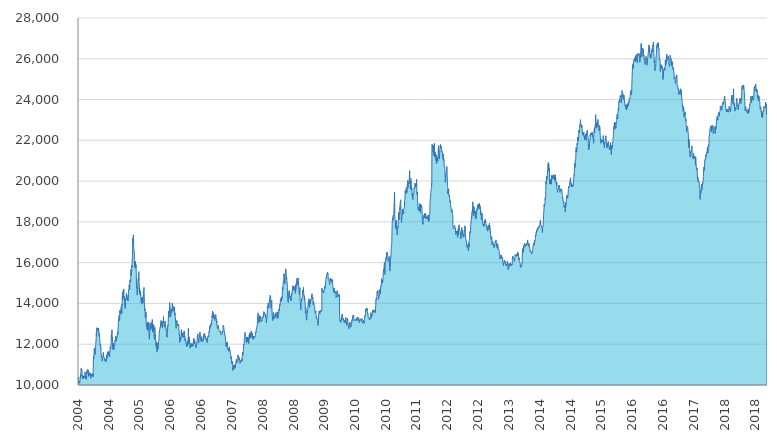
| Category | ICB |
|---|---|
| 2004-01-02 | 10000 |
| 2004-01-05 | 10226.385 |
| 2004-01-06 | 10384.872 |
| 2004-01-07 | 10288.02 |
| 2004-01-08 | 10213.6 |
| 2004-01-09 | 10173.267 |
| 2004-01-12 | 10197.253 |
| 2004-01-13 | 10195.708 |
| 2004-01-14 | 10145.057 |
| 2004-01-15 | 10087.779 |
| 2004-01-16 | 10147.823 |
| 2004-01-19 | 10229.214 |
| 2004-01-20 | 10405.341 |
| 2004-01-21 | 10366.841 |
| 2004-01-22 | 10520.916 |
| 2004-01-23 | 10407.08 |
| 2004-01-26 | 10699.998 |
| 2004-01-27 | 10803.626 |
| 2004-01-28 | 10741.446 |
| 2004-01-29 | 10805.027 |
| 2004-01-30 | 10780.426 |
| 2004-02-02 | 10747.586 |
| 2004-02-03 | 10600.139 |
| 2004-02-04 | 10427.461 |
| 2004-02-05 | 10487.058 |
| 2004-02-06 | 10367.771 |
| 2004-02-09 | 10293.299 |
| 2004-02-10 | 10457.689 |
| 2004-02-11 | 10330.727 |
| 2004-02-12 | 10387.953 |
| 2004-02-13 | 10345.823 |
| 2004-02-16 | 10329.406 |
| 2004-02-17 | 10445.147 |
| 2004-02-18 | 10334.424 |
| 2004-02-19 | 10368.844 |
| 2004-02-20 | 10377.153 |
| 2004-02-25 | 10464.3 |
| 2004-02-26 | 10641.545 |
| 2004-02-27 | 10587.933 |
| 2004-03-01 | 10479.385 |
| 2004-03-02 | 10363.636 |
| 2004-03-03 | 10308.924 |
| 2004-03-04 | 10395.507 |
| 2004-03-05 | 10359.939 |
| 2004-03-08 | 10412.348 |
| 2004-03-09 | 10278.133 |
| 2004-03-10 | 10387.27 |
| 2004-03-11 | 10657.972 |
| 2004-03-12 | 10561.22 |
| 2004-03-15 | 10690.399 |
| 2004-03-16 | 10758.439 |
| 2004-03-17 | 10657.382 |
| 2004-03-18 | 10627.488 |
| 2004-03-19 | 10626.24 |
| 2004-03-22 | 10732.745 |
| 2004-03-23 | 10733.175 |
| 2004-03-24 | 10743.198 |
| 2004-03-25 | 10420.792 |
| 2004-03-26 | 10493.157 |
| 2004-03-29 | 10553.775 |
| 2004-03-30 | 10603.082 |
| 2004-03-31 | 10605.783 |
| 2004-04-01 | 10612.008 |
| 2004-04-02 | 10605.604 |
| 2004-04-05 | 10444.404 |
| 2004-04-06 | 10490.833 |
| 2004-04-07 | 10570.321 |
| 2004-04-08 | 10585.074 |
| 2004-04-12 | 10524.391 |
| 2004-04-13 | 10329.102 |
| 2004-04-14 | 10414.022 |
| 2004-04-15 | 10446.349 |
| 2004-04-16 | 10435.625 |
| 2004-04-19 | 10466.336 |
| 2004-04-20 | 10549.683 |
| 2004-04-22 | 10447.529 |
| 2004-04-23 | 10436.699 |
| 2004-04-26 | 10435.311 |
| 2004-04-27 | 10558.286 |
| 2004-04-28 | 10540.295 |
| 2004-04-29 | 10538.65 |
| 2004-04-30 | 10407.59 |
| 2004-05-03 | 11262.389 |
| 2004-05-04 | 11408.749 |
| 2004-05-05 | 11328.924 |
| 2004-05-06 | 11297.731 |
| 2004-05-07 | 11432.457 |
| 2004-05-10 | 11781.258 |
| 2004-05-11 | 11674.1 |
| 2004-05-12 | 11776.315 |
| 2004-05-13 | 11817.174 |
| 2004-05-14 | 11594.768 |
| 2004-05-17 | 11488.635 |
| 2004-05-18 | 11683.239 |
| 2004-05-19 | 11815.736 |
| 2004-05-20 | 11844.096 |
| 2004-05-21 | 11982.556 |
| 2004-05-24 | 12198.78 |
| 2004-05-25 | 12274.062 |
| 2004-05-26 | 12558.47 |
| 2004-05-27 | 12423.163 |
| 2004-05-28 | 12573.597 |
| 2004-05-31 | 12814.849 |
| 2004-06-01 | 12720.113 |
| 2004-06-02 | 12791.431 |
| 2004-06-03 | 12762.095 |
| 2004-06-04 | 12766.636 |
| 2004-06-07 | 12620.423 |
| 2004-06-08 | 12662.955 |
| 2004-06-09 | 12781.211 |
| 2004-06-11 | 12794.869 |
| 2004-06-14 | 12725.119 |
| 2004-06-15 | 12509.287 |
| 2004-06-16 | 12546.936 |
| 2004-06-17 | 12393.009 |
| 2004-06-18 | 12505.642 |
| 2004-06-21 | 12295.024 |
| 2004-06-22 | 12210.085 |
| 2004-06-23 | 12134.181 |
| 2004-06-24 | 12120.795 |
| 2004-06-25 | 11937.802 |
| 2004-06-28 | 11991.012 |
| 2004-06-29 | 11896.103 |
| 2004-06-30 | 11919.736 |
| 2004-07-01 | 11855.571 |
| 2004-07-02 | 11543.948 |
| 2004-07-05 | 11373.027 |
| 2004-07-06 | 11394.053 |
| 2004-07-07 | 11432.2 |
| 2004-07-08 | 11398.256 |
| 2004-07-12 | 11165.635 |
| 2004-07-13 | 11193.224 |
| 2004-07-14 | 11305.329 |
| 2004-07-15 | 11399.563 |
| 2004-07-16 | 11402.646 |
| 2004-07-19 | 11403.991 |
| 2004-07-20 | 11600.611 |
| 2004-07-21 | 11469.199 |
| 2004-07-22 | 11504.326 |
| 2004-07-23 | 11384.558 |
| 2004-07-26 | 11342.696 |
| 2004-07-27 | 11346.592 |
| 2004-07-28 | 11326.723 |
| 2004-07-29 | 11250.566 |
| 2004-07-30 | 11193.229 |
| 2004-08-02 | 11219.57 |
| 2004-08-03 | 11284.004 |
| 2004-08-04 | 11215.927 |
| 2004-08-05 | 11243.058 |
| 2004-08-06 | 11225.994 |
| 2004-08-09 | 11240.029 |
| 2004-08-10 | 11126.411 |
| 2004-08-11 | 11138.165 |
| 2004-08-12 | 11160.884 |
| 2004-08-13 | 11181.128 |
| 2004-08-16 | 11468.445 |
| 2004-08-17 | 11492.81 |
| 2004-08-18 | 11296.246 |
| 2004-08-19 | 11391.215 |
| 2004-08-20 | 11377.096 |
| 2004-08-23 | 11615.153 |
| 2004-08-24 | 11564.252 |
| 2004-08-25 | 11580.828 |
| 2004-08-26 | 11634.735 |
| 2004-08-27 | 11608.129 |
| 2004-08-30 | 11451.291 |
| 2004-08-31 | 11497.755 |
| 2004-09-01 | 11631.317 |
| 2004-09-02 | 11660.988 |
| 2004-09-03 | 11557.301 |
| 2004-09-06 | 11534.009 |
| 2004-09-08 | 11390.073 |
| 2004-09-09 | 11609.024 |
| 2004-09-10 | 11605.981 |
| 2004-09-13 | 11822.301 |
| 2004-09-14 | 11872.606 |
| 2004-09-15 | 11770.545 |
| 2004-09-16 | 11854.586 |
| 2004-09-17 | 11841.725 |
| 2004-09-20 | 12070.183 |
| 2004-09-21 | 12320.676 |
| 2004-09-22 | 12473.635 |
| 2004-09-23 | 12290.553 |
| 2004-09-24 | 12402.135 |
| 2004-09-27 | 12712.989 |
| 2004-09-28 | 12283.498 |
| 2004-09-29 | 12356.659 |
| 2004-09-30 | 12306.296 |
| 2004-10-01 | 12079.943 |
| 2004-10-04 | 11745.38 |
| 2004-10-05 | 11912.738 |
| 2004-10-06 | 11972.846 |
| 2004-10-07 | 12063.096 |
| 2004-10-08 | 11877.111 |
| 2004-10-11 | 11804.592 |
| 2004-10-13 | 11729.811 |
| 2004-10-14 | 11836.705 |
| 2004-10-15 | 11964.842 |
| 2004-10-18 | 11942.356 |
| 2004-10-19 | 12011.307 |
| 2004-10-20 | 12165.555 |
| 2004-10-21 | 12158.872 |
| 2004-10-22 | 12109.704 |
| 2004-10-25 | 12255.085 |
| 2004-10-26 | 12225.091 |
| 2004-10-27 | 12405.04 |
| 2004-10-28 | 12383.85 |
| 2004-10-29 | 12199.725 |
| 2004-11-01 | 12157.878 |
| 2004-11-03 | 12277.801 |
| 2004-11-04 | 12331.126 |
| 2004-11-05 | 12313.033 |
| 2004-11-08 | 12511.712 |
| 2004-11-09 | 12521.516 |
| 2004-11-10 | 12565.146 |
| 2004-11-11 | 12634.174 |
| 2004-11-12 | 12469.086 |
| 2004-11-16 | 13020.265 |
| 2004-11-17 | 13195.34 |
| 2004-11-18 | 13248.834 |
| 2004-11-19 | 13249.469 |
| 2004-11-22 | 13407.914 |
| 2004-11-23 | 13335.348 |
| 2004-11-24 | 13320.814 |
| 2004-11-25 | 13259.628 |
| 2004-11-26 | 13154.354 |
| 2004-11-29 | 13674.389 |
| 2004-11-30 | 13464.281 |
| 2004-12-01 | 13606.684 |
| 2004-12-02 | 13579.579 |
| 2004-12-03 | 13555.175 |
| 2004-12-06 | 13615.081 |
| 2004-12-07 | 13687.496 |
| 2004-12-08 | 13804.293 |
| 2004-12-09 | 13846.816 |
| 2004-12-10 | 13652.328 |
| 2004-12-13 | 13546.865 |
| 2004-12-14 | 13493.345 |
| 2004-12-15 | 13964.554 |
| 2004-12-16 | 13886.022 |
| 2004-12-17 | 14292.979 |
| 2004-12-20 | 14561.121 |
| 2004-12-21 | 14411.527 |
| 2004-12-22 | 14182.883 |
| 2004-12-23 | 14594.586 |
| 2004-12-27 | 14514.052 |
| 2004-12-28 | 14503.145 |
| 2004-12-29 | 14709.838 |
| 2004-12-30 | 14289.635 |
| 2005-01-03 | 14323.83 |
| 2005-01-04 | 14354.716 |
| 2005-01-05 | 13924.641 |
| 2005-01-06 | 13947.709 |
| 2005-01-07 | 13817.528 |
| 2005-01-10 | 13742.224 |
| 2005-01-11 | 13786.109 |
| 2005-01-12 | 14057.763 |
| 2005-01-13 | 14252.914 |
| 2005-01-14 | 14190.411 |
| 2005-01-17 | 14178.061 |
| 2005-01-18 | 14492.513 |
| 2005-01-19 | 14465.934 |
| 2005-01-20 | 14365.233 |
| 2005-01-21 | 14332.407 |
| 2005-01-24 | 14391.888 |
| 2005-01-26 | 14321.097 |
| 2005-01-27 | 14156.947 |
| 2005-01-28 | 14263.281 |
| 2005-01-31 | 14173.268 |
| 2005-02-01 | 14174.393 |
| 2005-02-02 | 14137.093 |
| 2005-02-03 | 14138.028 |
| 2005-02-04 | 14678.646 |
| 2005-02-09 | 14732.793 |
| 2005-02-10 | 14918.179 |
| 2005-02-11 | 14797.797 |
| 2005-02-14 | 14667.816 |
| 2005-02-15 | 15107.303 |
| 2005-02-16 | 15113.932 |
| 2005-02-17 | 15081.359 |
| 2005-02-18 | 15165.007 |
| 2005-02-21 | 15039.212 |
| 2005-02-22 | 15118.6 |
| 2005-02-23 | 15588.029 |
| 2005-02-24 | 15673.488 |
| 2005-02-25 | 15355.76 |
| 2005-02-28 | 15536.061 |
| 2005-03-01 | 15579.685 |
| 2005-03-02 | 15643.538 |
| 2005-03-03 | 15865.664 |
| 2005-03-04 | 15764.601 |
| 2005-03-07 | 16281.247 |
| 2005-03-08 | 16633.868 |
| 2005-03-09 | 16630.158 |
| 2005-03-10 | 17204.255 |
| 2005-03-11 | 16975.528 |
| 2005-03-14 | 17102.876 |
| 2005-03-15 | 17367.914 |
| 2005-03-16 | 17189.634 |
| 2005-03-17 | 16966.272 |
| 2005-03-18 | 16680.309 |
| 2005-03-21 | 16567.043 |
| 2005-03-22 | 16521.382 |
| 2005-03-23 | 16112.526 |
| 2005-03-24 | 15838.388 |
| 2005-03-28 | 15953.038 |
| 2005-03-29 | 15740.167 |
| 2005-03-30 | 15973.228 |
| 2005-03-31 | 16074.216 |
| 2005-04-01 | 15836.431 |
| 2005-04-04 | 15744.663 |
| 2005-04-05 | 15908.041 |
| 2005-04-06 | 15596.449 |
| 2005-04-07 | 15504.945 |
| 2005-04-08 | 15005.962 |
| 2005-04-11 | 14723.851 |
| 2005-04-12 | 14793.178 |
| 2005-04-13 | 14721.811 |
| 2005-04-14 | 14407.916 |
| 2005-04-15 | 14610.339 |
| 2005-04-18 | 14560.267 |
| 2005-04-19 | 14974.808 |
| 2005-04-20 | 15138.842 |
| 2005-04-22 | 15214.854 |
| 2005-04-25 | 15103.108 |
| 2005-04-26 | 15559.116 |
| 2005-04-27 | 15566.624 |
| 2005-04-28 | 15469.07 |
| 2005-04-29 | 15062.54 |
| 2005-05-02 | 14617.4 |
| 2005-05-03 | 14486.364 |
| 2005-05-04 | 14730.051 |
| 2005-05-05 | 14508.962 |
| 2005-05-06 | 14532.984 |
| 2005-05-09 | 14461.442 |
| 2005-05-10 | 14387.593 |
| 2005-05-11 | 14593.722 |
| 2005-05-12 | 14442.52 |
| 2005-05-13 | 14444.209 |
| 2005-05-16 | 14072.104 |
| 2005-05-17 | 14262.523 |
| 2005-05-18 | 14156.733 |
| 2005-05-19 | 13985.747 |
| 2005-05-20 | 13967.45 |
| 2005-05-23 | 13979.474 |
| 2005-05-24 | 14168.252 |
| 2005-05-25 | 14320.97 |
| 2005-05-27 | 14144.056 |
| 2005-05-30 | 14045.003 |
| 2005-05-31 | 14028.063 |
| 2005-06-01 | 14146.167 |
| 2005-06-02 | 14292.976 |
| 2005-06-03 | 14597.5 |
| 2005-06-06 | 14664.704 |
| 2005-06-07 | 14787.817 |
| 2005-06-08 | 14468.017 |
| 2005-06-09 | 14312.105 |
| 2005-06-10 | 13963.247 |
| 2005-06-13 | 13637.501 |
| 2005-06-14 | 13733.877 |
| 2005-06-15 | 13742.89 |
| 2005-06-16 | 13520.525 |
| 2005-06-17 | 13304.089 |
| 2005-06-20 | 13443.62 |
| 2005-06-21 | 13331.115 |
| 2005-06-22 | 13585.692 |
| 2005-06-23 | 13424.032 |
| 2005-06-24 | 13182.571 |
| 2005-06-27 | 12871.751 |
| 2005-06-28 | 12997.058 |
| 2005-06-29 | 12847.92 |
| 2005-06-30 | 12895.331 |
| 2005-07-01 | 12717.829 |
| 2005-07-04 | 12705.574 |
| 2005-07-05 | 12817.882 |
| 2005-07-06 | 13092.963 |
| 2005-07-07 | 13021.334 |
| 2005-07-08 | 12925.081 |
| 2005-07-11 | 12661.902 |
| 2005-07-12 | 12719.739 |
| 2005-07-13 | 12766.001 |
| 2005-07-14 | 13064.616 |
| 2005-07-15 | 12781.053 |
| 2005-07-18 | 12417.838 |
| 2005-07-19 | 12242.347 |
| 2005-07-20 | 12308.73 |
| 2005-07-21 | 12385.329 |
| 2005-07-22 | 12497.933 |
| 2005-07-25 | 13025.058 |
| 2005-07-26 | 12976.492 |
| 2005-07-27 | 12734.447 |
| 2005-07-28 | 12873.043 |
| 2005-07-29 | 12936.691 |
| 2005-08-01 | 12828.193 |
| 2005-08-02 | 13070.474 |
| 2005-08-03 | 12874.938 |
| 2005-08-04 | 12846.204 |
| 2005-08-05 | 12843.753 |
| 2005-08-08 | 12771.511 |
| 2005-08-09 | 12724.118 |
| 2005-08-10 | 12882.136 |
| 2005-08-11 | 13214.52 |
| 2005-08-12 | 13201.107 |
| 2005-08-15 | 12589.342 |
| 2005-08-16 | 12726.92 |
| 2005-08-17 | 12754.793 |
| 2005-08-18 | 12665.103 |
| 2005-08-19 | 12969.944 |
| 2005-08-22 | 12690.706 |
| 2005-08-23 | 12933.426 |
| 2005-08-24 | 12823.658 |
| 2005-08-25 | 12488.78 |
| 2005-08-26 | 12390 |
| 2005-08-29 | 12238.581 |
| 2005-08-30 | 12394.012 |
| 2005-08-31 | 12535.451 |
| 2005-09-01 | 12825.23 |
| 2005-09-02 | 12525.223 |
| 2005-09-05 | 12505.745 |
| 2005-09-06 | 12356.828 |
| 2005-09-08 | 12014.667 |
| 2005-09-09 | 11935.251 |
| 2005-09-12 | 11850.474 |
| 2005-09-13 | 11919.164 |
| 2005-09-14 | 12119.492 |
| 2005-09-15 | 11937.683 |
| 2005-09-16 | 11773.265 |
| 2005-09-19 | 11613.74 |
| 2005-09-20 | 12027.94 |
| 2005-09-21 | 11928.025 |
| 2005-09-22 | 12039.052 |
| 2005-09-23 | 11962.55 |
| 2005-09-26 | 11749.113 |
| 2005-09-27 | 11835.647 |
| 2005-09-28 | 12077.523 |
| 2005-09-29 | 12016.711 |
| 2005-09-30 | 12136.826 |
| 2005-10-03 | 12173.39 |
| 2005-10-04 | 12330.307 |
| 2005-10-05 | 12532.217 |
| 2005-10-06 | 12609.842 |
| 2005-10-07 | 12579.495 |
| 2005-10-10 | 12740.224 |
| 2005-10-11 | 12780.44 |
| 2005-10-13 | 12825.679 |
| 2005-10-14 | 12802.725 |
| 2005-10-17 | 13038.768 |
| 2005-10-18 | 13074.791 |
| 2005-10-19 | 13061.201 |
| 2005-10-20 | 13169.254 |
| 2005-10-21 | 12963.236 |
| 2005-10-24 | 12884.263 |
| 2005-10-25 | 13029.772 |
| 2005-10-26 | 13024.236 |
| 2005-10-27 | 13100.975 |
| 2005-10-28 | 13025.542 |
| 2005-10-31 | 12816.306 |
| 2005-11-01 | 12808.609 |
| 2005-11-03 | 13120.805 |
| 2005-11-04 | 13126.283 |
| 2005-11-07 | 13052.448 |
| 2005-11-08 | 13360.276 |
| 2005-11-09 | 13183.59 |
| 2005-11-10 | 13140.067 |
| 2005-11-11 | 13119.478 |
| 2005-11-14 | 12998.565 |
| 2005-11-16 | 12837.4 |
| 2005-11-17 | 12932.211 |
| 2005-11-18 | 12863.059 |
| 2005-11-21 | 13083.923 |
| 2005-11-22 | 13128.875 |
| 2005-11-23 | 12922.981 |
| 2005-11-24 | 12871.261 |
| 2005-11-25 | 12899.553 |
| 2005-11-28 | 12765.408 |
| 2005-11-29 | 12776.071 |
| 2005-11-30 | 12554.298 |
| 2005-12-01 | 12512.209 |
| 2005-12-02 | 12380.212 |
| 2005-12-05 | 12454.765 |
| 2005-12-06 | 12355.096 |
| 2005-12-07 | 12342.742 |
| 2005-12-08 | 12492.442 |
| 2005-12-09 | 12540.043 |
| 2005-12-12 | 12923.838 |
| 2005-12-13 | 12871.606 |
| 2005-12-14 | 12871.789 |
| 2005-12-15 | 13056.465 |
| 2005-12-16 | 13237.376 |
| 2005-12-19 | 13632.88 |
| 2005-12-20 | 13574.767 |
| 2005-12-21 | 13319.736 |
| 2005-12-22 | 13578.875 |
| 2005-12-23 | 13479.32 |
| 2005-12-26 | 13647.484 |
| 2005-12-27 | 14048.224 |
| 2005-12-28 | 13917.07 |
| 2005-12-29 | 13896.607 |
| 2006-01-02 | 13334.091 |
| 2006-01-03 | 13434.468 |
| 2006-01-04 | 13363.237 |
| 2006-01-05 | 13578.364 |
| 2006-01-06 | 13726.538 |
| 2006-01-09 | 13678.07 |
| 2006-01-10 | 13558.768 |
| 2006-01-11 | 13572.259 |
| 2006-01-12 | 13527.696 |
| 2006-01-13 | 13722.061 |
| 2006-01-16 | 13797.782 |
| 2006-01-17 | 14019.182 |
| 2006-01-18 | 13893.24 |
| 2006-01-19 | 13881.228 |
| 2006-01-20 | 13646.262 |
| 2006-01-23 | 13754.139 |
| 2006-01-24 | 13810.304 |
| 2006-01-26 | 13811.092 |
| 2006-01-27 | 13864.346 |
| 2006-01-30 | 13805.937 |
| 2006-01-31 | 13594.286 |
| 2006-02-01 | 13627.696 |
| 2006-02-02 | 13826.118 |
| 2006-02-03 | 13733.423 |
| 2006-02-06 | 13421.187 |
| 2006-02-07 | 13543.879 |
| 2006-02-08 | 13386.556 |
| 2006-02-09 | 13352.128 |
| 2006-02-10 | 13330.753 |
| 2006-02-13 | 12998.476 |
| 2006-02-14 | 12929.433 |
| 2006-02-15 | 12915.58 |
| 2006-02-16 | 12774.048 |
| 2006-02-17 | 12993.018 |
| 2006-02-20 | 13012.575 |
| 2006-02-21 | 13163.556 |
| 2006-02-22 | 13069.258 |
| 2006-02-23 | 13108.667 |
| 2006-02-24 | 13000.655 |
| 2006-03-01 | 12940.751 |
| 2006-03-02 | 12894.248 |
| 2006-03-03 | 12976.965 |
| 2006-03-06 | 12939.12 |
| 2006-03-07 | 12974.28 |
| 2006-03-08 | 12927.138 |
| 2006-03-09 | 12923.906 |
| 2006-03-10 | 12704.258 |
| 2006-03-13 | 12526.052 |
| 2006-03-14 | 12404.914 |
| 2006-03-15 | 12490.586 |
| 2006-03-16 | 12216.867 |
| 2006-03-17 | 12094.171 |
| 2006-03-20 | 12206.392 |
| 2006-03-21 | 12359.004 |
| 2006-03-22 | 12185.795 |
| 2006-03-23 | 12190.788 |
| 2006-03-24 | 12220.101 |
| 2006-03-27 | 12354.949 |
| 2006-03-28 | 12592.873 |
| 2006-03-29 | 12568.621 |
| 2006-03-30 | 12727.973 |
| 2006-03-31 | 12481.482 |
| 2006-04-03 | 12541.905 |
| 2006-04-04 | 12379.937 |
| 2006-04-05 | 12455.285 |
| 2006-04-06 | 12488.45 |
| 2006-04-07 | 12557.554 |
| 2006-04-10 | 12542.727 |
| 2006-04-11 | 12324.764 |
| 2006-04-12 | 12336.348 |
| 2006-04-13 | 12342.986 |
| 2006-04-17 | 12434.121 |
| 2006-04-18 | 12568.208 |
| 2006-04-19 | 12506.549 |
| 2006-04-20 | 12656.038 |
| 2006-04-24 | 12562.696 |
| 2006-04-25 | 12339.676 |
| 2006-04-26 | 12391.021 |
| 2006-04-27 | 12160.256 |
| 2006-04-28 | 12191.378 |
| 2006-05-02 | 12281.743 |
| 2006-05-03 | 12213.132 |
| 2006-05-04 | 12080.467 |
| 2006-05-05 | 11998.261 |
| 2006-05-08 | 11975.882 |
| 2006-05-09 | 12000.451 |
| 2006-05-10 | 11974.576 |
| 2006-05-11 | 11875.379 |
| 2006-05-12 | 12034.861 |
| 2006-05-15 | 12134.58 |
| 2006-05-16 | 11929.113 |
| 2006-05-17 | 12090.928 |
| 2006-05-18 | 11954.42 |
| 2006-05-19 | 11969.098 |
| 2006-05-22 | 12314.117 |
| 2006-05-23 | 12387.15 |
| 2006-05-24 | 12784.945 |
| 2006-05-25 | 12337.524 |
| 2006-05-26 | 12035.775 |
| 2006-05-29 | 12138.69 |
| 2006-05-30 | 12365.417 |
| 2006-05-31 | 12270.068 |
| 2006-06-01 | 12062.58 |
| 2006-06-02 | 12265.027 |
| 2006-06-05 | 11920.036 |
| 2006-06-06 | 11810.908 |
| 2006-06-07 | 11808.949 |
| 2006-06-08 | 11948.657 |
| 2006-06-09 | 11908.723 |
| 2006-06-12 | 11947.97 |
| 2006-06-13 | 12063.055 |
| 2006-06-14 | 12038.824 |
| 2006-06-16 | 11922.506 |
| 2006-06-19 | 11877.941 |
| 2006-06-20 | 12019.825 |
| 2006-06-21 | 11948.356 |
| 2006-06-22 | 12018.515 |
| 2006-06-23 | 11924.859 |
| 2006-06-26 | 11904.212 |
| 2006-06-27 | 11969.99 |
| 2006-06-28 | 12022.083 |
| 2006-06-29 | 11912.35 |
| 2006-06-30 | 11986.616 |
| 2006-07-03 | 12181.696 |
| 2006-07-04 | 12230.577 |
| 2006-07-05 | 12295.113 |
| 2006-07-06 | 12210.244 |
| 2006-07-07 | 12030.711 |
| 2006-07-10 | 12062.184 |
| 2006-07-11 | 12030.238 |
| 2006-07-12 | 12105.017 |
| 2006-07-13 | 12220.321 |
| 2006-07-14 | 12149.766 |
| 2006-07-17 | 12016.695 |
| 2006-07-18 | 11979.421 |
| 2006-07-19 | 11892.033 |
| 2006-07-20 | 11865.53 |
| 2006-07-21 | 11906.232 |
| 2006-07-24 | 11832.555 |
| 2006-07-25 | 11914.586 |
| 2006-07-26 | 11890.718 |
| 2006-07-27 | 11935.341 |
| 2006-07-28 | 12079.203 |
| 2006-07-31 | 12050.185 |
| 2006-08-01 | 12074.869 |
| 2006-08-02 | 12303.867 |
| 2006-08-03 | 12403.636 |
| 2006-08-04 | 12424.846 |
| 2006-08-07 | 12507.564 |
| 2006-08-08 | 12510.537 |
| 2006-08-09 | 12404.716 |
| 2006-08-10 | 12291.72 |
| 2006-08-11 | 12270.745 |
| 2006-08-14 | 12071.62 |
| 2006-08-15 | 12118.517 |
| 2006-08-16 | 12224.368 |
| 2006-08-17 | 12257.332 |
| 2006-08-18 | 12314.76 |
| 2006-08-21 | 12468.675 |
| 2006-08-22 | 12584.852 |
| 2006-08-23 | 12562.007 |
| 2006-08-24 | 12603.742 |
| 2006-08-25 | 12529.35 |
| 2006-08-28 | 12362.291 |
| 2006-08-29 | 12321.156 |
| 2006-08-30 | 12218.864 |
| 2006-08-31 | 12305.582 |
| 2006-09-01 | 12157.639 |
| 2006-09-04 | 12116.972 |
| 2006-09-05 | 12283.509 |
| 2006-09-06 | 12373.817 |
| 2006-09-08 | 12255.482 |
| 2006-09-11 | 12145.737 |
| 2006-09-12 | 12146.487 |
| 2006-09-13 | 12200.487 |
| 2006-09-14 | 12160.706 |
| 2006-09-15 | 12146.061 |
| 2006-09-18 | 12163.668 |
| 2006-09-19 | 12286.912 |
| 2006-09-20 | 12235.445 |
| 2006-09-21 | 12422.86 |
| 2006-09-22 | 12407.084 |
| 2006-09-25 | 12519.925 |
| 2006-09-26 | 12454.378 |
| 2006-09-27 | 12491.877 |
| 2006-09-28 | 12528.512 |
| 2006-09-29 | 12533.432 |
| 2006-10-02 | 12344.158 |
| 2006-10-03 | 12412.559 |
| 2006-10-04 | 12351.772 |
| 2006-10-05 | 12278.479 |
| 2006-10-06 | 12345.535 |
| 2006-10-09 | 12286.32 |
| 2006-10-10 | 12272.716 |
| 2006-10-11 | 12233.405 |
| 2006-10-13 | 12284.899 |
| 2006-10-16 | 12167.027 |
| 2006-10-17 | 12191.008 |
| 2006-10-18 | 12146.662 |
| 2006-10-19 | 12076.152 |
| 2006-10-20 | 12075.346 |
| 2006-10-23 | 12335.035 |
| 2006-10-24 | 12342.272 |
| 2006-10-25 | 12368.927 |
| 2006-10-26 | 12330.739 |
| 2006-10-27 | 12376.992 |
| 2006-10-30 | 12418.798 |
| 2006-10-31 | 12361.576 |
| 2006-11-01 | 12394.269 |
| 2006-11-03 | 12628.432 |
| 2006-11-06 | 12673.697 |
| 2006-11-07 | 12589.899 |
| 2006-11-08 | 12832.054 |
| 2006-11-09 | 12900.237 |
| 2006-11-10 | 12769.52 |
| 2006-11-13 | 12870.599 |
| 2006-11-14 | 12954.606 |
| 2006-11-16 | 12962.448 |
| 2006-11-17 | 12878.839 |
| 2006-11-21 | 13037.52 |
| 2006-11-22 | 13086.145 |
| 2006-11-23 | 12959.069 |
| 2006-11-24 | 13097.828 |
| 2006-11-27 | 13258.519 |
| 2006-11-28 | 13411.742 |
| 2006-11-29 | 13304.224 |
| 2006-11-30 | 13426.684 |
| 2006-12-01 | 13626.24 |
| 2006-12-04 | 13456.715 |
| 2006-12-05 | 13555.824 |
| 2006-12-06 | 13368.626 |
| 2006-12-07 | 13275.891 |
| 2006-12-08 | 13310.756 |
| 2006-12-11 | 13456.49 |
| 2006-12-12 | 13476.659 |
| 2006-12-13 | 13466.776 |
| 2006-12-14 | 13417.584 |
| 2006-12-15 | 13289.958 |
| 2006-12-18 | 13215.014 |
| 2006-12-19 | 13152.174 |
| 2006-12-20 | 13331.998 |
| 2006-12-21 | 13306.572 |
| 2006-12-22 | 13246.405 |
| 2006-12-26 | 13386.973 |
| 2006-12-27 | 13449.967 |
| 2006-12-28 | 13289.379 |
| 2007-01-02 | 13257.946 |
| 2007-01-03 | 13044.534 |
| 2007-01-04 | 13129.016 |
| 2007-01-05 | 12867.706 |
| 2007-01-08 | 12836.496 |
| 2007-01-09 | 12747.766 |
| 2007-01-10 | 12851.87 |
| 2007-01-11 | 12815.032 |
| 2007-01-12 | 12803.797 |
| 2007-01-15 | 12845.399 |
| 2007-01-16 | 12939.613 |
| 2007-01-17 | 12904.065 |
| 2007-01-18 | 12789.428 |
| 2007-01-19 | 12776.99 |
| 2007-01-22 | 12685.416 |
| 2007-01-23 | 12634.769 |
| 2007-01-24 | 12637.173 |
| 2007-01-26 | 12613.573 |
| 2007-01-29 | 12626.277 |
| 2007-01-30 | 12613.687 |
| 2007-01-31 | 12626.634 |
| 2007-02-01 | 12650.024 |
| 2007-02-02 | 12591.308 |
| 2007-02-05 | 12531.405 |
| 2007-02-06 | 12464.45 |
| 2007-02-07 | 12486.263 |
| 2007-02-08 | 12451.346 |
| 2007-02-09 | 12478.076 |
| 2007-02-12 | 12469.73 |
| 2007-02-13 | 12492.946 |
| 2007-02-14 | 12512.039 |
| 2007-02-15 | 12619.272 |
| 2007-02-16 | 12569.723 |
| 2007-02-21 | 12665.262 |
| 2007-02-22 | 12917.231 |
| 2007-02-23 | 12928.976 |
| 2007-02-26 | 12879.055 |
| 2007-02-27 | 12887.578 |
| 2007-02-28 | 12848.258 |
| 2007-03-01 | 12768.638 |
| 2007-03-02 | 12718.732 |
| 2007-03-05 | 12542.48 |
| 2007-03-06 | 12541.527 |
| 2007-03-07 | 12454.808 |
| 2007-03-08 | 12480.18 |
| 2007-03-09 | 12462.984 |
| 2007-03-12 | 12399.519 |
| 2007-03-13 | 12302.39 |
| 2007-03-14 | 12132.773 |
| 2007-03-15 | 12085.108 |
| 2007-03-16 | 11979.835 |
| 2007-03-19 | 11890.969 |
| 2007-03-20 | 11867.821 |
| 2007-03-21 | 11989.488 |
| 2007-03-22 | 11955.886 |
| 2007-03-23 | 12101.838 |
| 2007-03-26 | 12119.06 |
| 2007-03-27 | 12013.408 |
| 2007-03-28 | 12083.583 |
| 2007-03-29 | 11826.265 |
| 2007-03-30 | 11820.56 |
| 2007-04-02 | 11727.134 |
| 2007-04-03 | 11786.911 |
| 2007-04-04 | 11762.69 |
| 2007-04-05 | 11778.468 |
| 2007-04-09 | 11685.824 |
| 2007-04-10 | 11641.619 |
| 2007-04-11 | 11692.987 |
| 2007-04-12 | 11876.993 |
| 2007-04-13 | 11798.53 |
| 2007-04-16 | 11675.956 |
| 2007-04-17 | 11725.627 |
| 2007-04-18 | 11678.668 |
| 2007-04-19 | 11645.447 |
| 2007-04-20 | 11559.546 |
| 2007-04-23 | 11509.995 |
| 2007-04-24 | 11367.962 |
| 2007-04-25 | 11282.296 |
| 2007-04-26 | 11300.692 |
| 2007-04-27 | 11300.341 |
| 2007-04-30 | 11390.53 |
| 2007-05-02 | 11054.491 |
| 2007-05-03 | 11060.189 |
| 2007-05-04 | 11171.71 |
| 2007-05-07 | 11068.425 |
| 2007-05-08 | 11063.024 |
| 2007-05-09 | 11120.869 |
| 2007-05-10 | 10714.19 |
| 2007-05-11 | 10716.183 |
| 2007-05-14 | 10828.477 |
| 2007-05-15 | 10738.561 |
| 2007-05-16 | 10797.563 |
| 2007-05-17 | 10966.574 |
| 2007-05-18 | 10893.675 |
| 2007-05-21 | 10906.029 |
| 2007-05-22 | 10794.978 |
| 2007-05-23 | 10875.537 |
| 2007-05-24 | 10992.013 |
| 2007-05-25 | 10928.724 |
| 2007-05-28 | 10878.887 |
| 2007-05-29 | 10868.231 |
| 2007-05-30 | 10828.833 |
| 2007-05-31 | 10866.404 |
| 2007-06-01 | 10982.426 |
| 2007-06-04 | 11089.446 |
| 2007-06-05 | 11137.988 |
| 2007-06-06 | 11261.23 |
| 2007-06-08 | 11262.386 |
| 2007-06-11 | 11136.157 |
| 2007-06-12 | 11073.043 |
| 2007-06-13 | 11138.213 |
| 2007-06-14 | 11138.5 |
| 2007-06-15 | 11142.242 |
| 2007-06-18 | 11192.971 |
| 2007-06-19 | 11196.629 |
| 2007-06-20 | 11479.964 |
| 2007-06-21 | 11388.693 |
| 2007-06-22 | 11421.454 |
| 2007-06-25 | 11216.999 |
| 2007-06-26 | 11283.646 |
| 2007-06-27 | 11268.913 |
| 2007-06-28 | 11237.809 |
| 2007-06-29 | 11357.878 |
| 2007-07-02 | 11199.632 |
| 2007-07-03 | 11152.718 |
| 2007-07-04 | 11133.838 |
| 2007-07-05 | 11121.798 |
| 2007-07-06 | 11067.587 |
| 2007-07-10 | 11176.014 |
| 2007-07-11 | 11205.687 |
| 2007-07-12 | 11181.477 |
| 2007-07-13 | 11117.892 |
| 2007-07-16 | 11186.654 |
| 2007-07-17 | 11172.988 |
| 2007-07-18 | 11280.486 |
| 2007-07-19 | 11289.39 |
| 2007-07-20 | 11291.153 |
| 2007-07-23 | 11175.731 |
| 2007-07-24 | 11388.229 |
| 2007-07-25 | 11423.868 |
| 2007-07-26 | 11611.206 |
| 2007-07-27 | 11548.326 |
| 2007-07-30 | 11455.589 |
| 2007-07-31 | 11540.902 |
| 2007-08-01 | 11584.056 |
| 2007-08-02 | 11691.823 |
| 2007-08-03 | 11897.656 |
| 2007-08-06 | 12008.992 |
| 2007-08-07 | 11971.782 |
| 2007-08-08 | 11979.488 |
| 2007-08-09 | 12177.721 |
| 2007-08-10 | 12337.466 |
| 2007-08-13 | 12348.151 |
| 2007-08-14 | 12521.332 |
| 2007-08-15 | 12585.515 |
| 2007-08-16 | 12555.828 |
| 2007-08-17 | 12430.386 |
| 2007-08-20 | 12425.995 |
| 2007-08-21 | 12388.128 |
| 2007-08-22 | 12357.72 |
| 2007-08-23 | 12284.161 |
| 2007-08-24 | 12104.357 |
| 2007-08-27 | 12065.258 |
| 2007-08-28 | 12341.581 |
| 2007-08-29 | 12135.856 |
| 2007-08-30 | 12231.624 |
| 2007-08-31 | 12103.094 |
| 2007-09-03 | 12254.155 |
| 2007-09-04 | 12352.309 |
| 2007-09-05 | 12310.782 |
| 2007-09-06 | 12235.805 |
| 2007-09-10 | 12319.849 |
| 2007-09-11 | 12201.388 |
| 2007-09-12 | 12174.862 |
| 2007-09-13 | 12033.16 |
| 2007-09-14 | 12030.364 |
| 2007-09-17 | 12454.258 |
| 2007-09-18 | 12264.608 |
| 2007-09-19 | 12308.574 |
| 2007-09-20 | 12558.499 |
| 2007-09-21 | 12330.866 |
| 2007-09-24 | 12550.481 |
| 2007-09-25 | 12532.695 |
| 2007-09-26 | 12341.216 |
| 2007-09-27 | 12381.124 |
| 2007-09-28 | 12339.864 |
| 2007-10-01 | 12555.032 |
| 2007-10-02 | 12524.372 |
| 2007-10-03 | 12655.622 |
| 2007-10-04 | 12628.248 |
| 2007-10-05 | 12563.404 |
| 2007-10-08 | 12568.058 |
| 2007-10-09 | 12304.945 |
| 2007-10-10 | 12346.933 |
| 2007-10-11 | 12547.5 |
| 2007-10-15 | 12374.167 |
| 2007-10-16 | 12311.446 |
| 2007-10-17 | 12398.232 |
| 2007-10-18 | 12217.619 |
| 2007-10-19 | 12258.977 |
| 2007-10-22 | 12274.355 |
| 2007-10-23 | 12317.166 |
| 2007-10-24 | 12395.625 |
| 2007-10-25 | 12314.626 |
| 2007-10-26 | 12318.963 |
| 2007-10-29 | 12322.332 |
| 2007-10-30 | 12336.411 |
| 2007-10-31 | 12319.772 |
| 2007-11-01 | 12408.184 |
| 2007-11-05 | 12417.122 |
| 2007-11-06 | 12478.707 |
| 2007-11-07 | 12556.511 |
| 2007-11-08 | 12606.535 |
| 2007-11-09 | 12556.557 |
| 2007-11-12 | 12716.37 |
| 2007-11-13 | 12794.37 |
| 2007-11-14 | 12769.575 |
| 2007-11-16 | 12839.383 |
| 2007-11-19 | 12912.737 |
| 2007-11-21 | 13131.701 |
| 2007-11-22 | 13162.005 |
| 2007-11-23 | 13344.349 |
| 2007-11-26 | 13508.366 |
| 2007-11-27 | 13538.779 |
| 2007-11-28 | 13306.27 |
| 2007-11-29 | 13058.493 |
| 2007-11-30 | 13184.687 |
| 2007-12-03 | 13310.959 |
| 2007-12-04 | 13402.406 |
| 2007-12-05 | 13308.511 |
| 2007-12-06 | 13079.183 |
| 2007-12-07 | 13108.021 |
| 2007-12-10 | 13271.218 |
| 2007-12-11 | 13304.673 |
| 2007-12-12 | 13397.315 |
| 2007-12-13 | 13240.024 |
| 2007-12-14 | 13275.67 |
| 2007-12-17 | 13337.538 |
| 2007-12-18 | 13261.23 |
| 2007-12-19 | 13107.173 |
| 2007-12-20 | 13145.706 |
| 2007-12-21 | 13129.152 |
| 2007-12-26 | 13165.215 |
| 2007-12-27 | 13139.024 |
| 2007-12-28 | 13317.497 |
| 2008-01-02 | 13286.005 |
| 2008-01-03 | 13352.855 |
| 2008-01-04 | 13311.211 |
| 2008-01-07 | 13333.712 |
| 2008-01-08 | 13482.74 |
| 2008-01-09 | 13563.483 |
| 2008-01-10 | 13598.616 |
| 2008-01-11 | 13588.439 |
| 2008-01-14 | 13584.319 |
| 2008-01-15 | 13556.051 |
| 2008-01-16 | 13563.501 |
| 2008-01-17 | 13542.287 |
| 2008-01-18 | 13441.986 |
| 2008-01-21 | 13490.731 |
| 2008-01-22 | 13453.191 |
| 2008-01-23 | 13431.425 |
| 2008-01-24 | 13338.224 |
| 2008-01-28 | 13402.94 |
| 2008-01-29 | 13273.908 |
| 2008-01-30 | 13225.777 |
| 2008-01-31 | 13051.385 |
| 2008-02-01 | 13156.817 |
| 2008-02-06 | 13465.705 |
| 2008-02-07 | 13624.274 |
| 2008-02-08 | 13855.27 |
| 2008-02-11 | 13823.868 |
| 2008-02-12 | 13781.248 |
| 2008-02-13 | 13820.075 |
| 2008-02-14 | 14023.768 |
| 2008-02-15 | 13914.338 |
| 2008-02-18 | 13776.422 |
| 2008-02-19 | 13915.877 |
| 2008-02-20 | 13895.992 |
| 2008-02-21 | 13885.821 |
| 2008-02-22 | 14038.255 |
| 2008-02-25 | 14180.003 |
| 2008-02-26 | 14053.468 |
| 2008-02-27 | 14195.402 |
| 2008-02-28 | 14339.52 |
| 2008-02-29 | 14399.797 |
| 2008-03-03 | 14345.853 |
| 2008-03-04 | 14356.915 |
| 2008-03-05 | 14279.029 |
| 2008-03-06 | 14041.902 |
| 2008-03-07 | 13756.638 |
| 2008-03-10 | 13861.746 |
| 2008-03-11 | 13938.987 |
| 2008-03-12 | 13924.362 |
| 2008-03-13 | 14154.255 |
| 2008-03-14 | 13938.28 |
| 2008-03-17 | 13404.822 |
| 2008-03-18 | 13394.496 |
| 2008-03-19 | 13166.506 |
| 2008-03-20 | 13155.787 |
| 2008-03-24 | 13265.704 |
| 2008-03-25 | 13494.99 |
| 2008-03-26 | 13554.92 |
| 2008-03-27 | 13558.365 |
| 2008-03-28 | 13427.836 |
| 2008-03-31 | 13231.427 |
| 2008-04-01 | 13371.264 |
| 2008-04-02 | 13326.676 |
| 2008-04-03 | 13307.534 |
| 2008-04-04 | 13333.599 |
| 2008-04-07 | 13348.728 |
| 2008-04-08 | 13360.558 |
| 2008-04-09 | 13493.317 |
| 2008-04-10 | 13322.332 |
| 2008-04-11 | 13364.493 |
| 2008-04-14 | 13339.581 |
| 2008-04-15 | 13466.991 |
| 2008-04-16 | 13407.107 |
| 2008-04-17 | 13565.751 |
| 2008-04-18 | 13522.792 |
| 2008-04-22 | 13490.298 |
| 2008-04-23 | 13448.691 |
| 2008-04-24 | 13348.12 |
| 2008-04-25 | 13273.853 |
| 2008-04-28 | 13398.998 |
| 2008-04-29 | 13590.175 |
| 2008-04-30 | 13526.211 |
| 2008-05-02 | 13269.412 |
| 2008-05-05 | 13408.937 |
| 2008-05-06 | 13408.599 |
| 2008-05-07 | 13462.181 |
| 2008-05-08 | 13623.066 |
| 2008-05-09 | 13726.922 |
| 2008-05-12 | 13660.672 |
| 2008-05-13 | 13638.609 |
| 2008-05-14 | 13876.367 |
| 2008-05-15 | 13843.159 |
| 2008-05-16 | 13961.043 |
| 2008-05-19 | 13918.616 |
| 2008-05-20 | 14053.985 |
| 2008-05-21 | 14212.786 |
| 2008-05-23 | 14172.661 |
| 2008-05-26 | 14232.364 |
| 2008-05-27 | 14269.94 |
| 2008-05-28 | 14303.313 |
| 2008-05-29 | 14094.669 |
| 2008-05-30 | 14180.687 |
| 2008-06-02 | 14330.395 |
| 2008-06-03 | 14245.974 |
| 2008-06-04 | 14276.462 |
| 2008-06-05 | 14563.722 |
| 2008-06-06 | 14804.651 |
| 2008-06-09 | 14648.302 |
| 2008-06-10 | 14868.149 |
| 2008-06-11 | 14977.748 |
| 2008-06-12 | 15055.981 |
| 2008-06-13 | 15066.031 |
| 2008-06-16 | 15165.479 |
| 2008-06-17 | 15327.523 |
| 2008-06-18 | 15468.523 |
| 2008-06-19 | 15341.515 |
| 2008-06-20 | 15386.445 |
| 2008-06-23 | 15120.811 |
| 2008-06-24 | 15129.145 |
| 2008-06-25 | 14947.013 |
| 2008-06-26 | 15242.01 |
| 2008-06-27 | 15374.094 |
| 2008-06-30 | 15464.825 |
| 2008-07-01 | 15640.217 |
| 2008-07-02 | 15698.671 |
| 2008-07-03 | 15693.619 |
| 2008-07-04 | 15593.713 |
| 2008-07-07 | 15198.94 |
| 2008-07-08 | 15171.696 |
| 2008-07-10 | 15248.671 |
| 2008-07-11 | 15120.835 |
| 2008-07-14 | 14946.244 |
| 2008-07-15 | 14776.501 |
| 2008-07-16 | 14625.127 |
| 2008-07-17 | 14239.249 |
| 2008-07-18 | 14166.241 |
| 2008-07-21 | 14078.049 |
| 2008-07-22 | 14050.085 |
| 2008-07-23 | 14156.246 |
| 2008-07-24 | 14324.952 |
| 2008-07-25 | 14446.496 |
| 2008-07-28 | 14559.701 |
| 2008-07-29 | 14633.925 |
| 2008-07-30 | 14364.045 |
| 2008-07-31 | 14557.162 |
| 2008-08-01 | 14317.176 |
| 2008-08-04 | 14290.523 |
| 2008-08-05 | 14385.17 |
| 2008-08-06 | 14297.82 |
| 2008-08-07 | 14320.169 |
| 2008-08-08 | 14191.72 |
| 2008-08-11 | 14188.115 |
| 2008-08-12 | 14276.812 |
| 2008-08-13 | 14124.91 |
| 2008-08-14 | 14301.343 |
| 2008-08-15 | 14294.387 |
| 2008-08-18 | 14485.196 |
| 2008-08-19 | 14410.563 |
| 2008-08-20 | 14417.492 |
| 2008-08-21 | 14575.236 |
| 2008-08-22 | 14657.248 |
| 2008-08-25 | 14644.321 |
| 2008-08-26 | 14867.548 |
| 2008-08-27 | 14783.953 |
| 2008-08-28 | 14701.335 |
| 2008-08-29 | 14675.964 |
| 2008-09-01 | 14644.637 |
| 2008-09-02 | 14675.751 |
| 2008-09-03 | 14765.772 |
| 2008-09-04 | 14861.33 |
| 2008-09-05 | 14696.963 |
| 2008-09-08 | 14732.18 |
| 2008-09-09 | 14791.743 |
| 2008-09-10 | 14770.124 |
| 2008-09-11 | 14681.272 |
| 2008-09-12 | 14621.7 |
| 2008-09-15 | 14653.266 |
| 2008-09-16 | 14494.36 |
| 2008-09-17 | 14648.335 |
| 2008-09-18 | 14919.639 |
| 2008-09-19 | 14642.331 |
| 2008-09-22 | 14795.679 |
| 2008-09-23 | 14944.661 |
| 2008-09-24 | 15019.881 |
| 2008-09-25 | 15003.245 |
| 2008-09-26 | 15029.224 |
| 2008-09-29 | 15238.565 |
| 2008-09-30 | 14878.7 |
| 2008-10-01 | 14912.973 |
| 2008-10-02 | 15056.692 |
| 2008-10-03 | 15014.004 |
| 2008-10-06 | 14934.045 |
| 2008-10-07 | 15230.755 |
| 2008-10-08 | 15250.231 |
| 2008-10-09 | 15007.489 |
| 2008-10-10 | 15047.79 |
| 2008-10-13 | 14881.221 |
| 2008-10-14 | 14702.22 |
| 2008-10-15 | 14633.008 |
| 2008-10-16 | 14612.941 |
| 2008-10-17 | 14443.589 |
| 2008-10-20 | 14490.29 |
| 2008-10-21 | 14694.765 |
| 2008-10-22 | 14778.539 |
| 2008-10-23 | 14297.021 |
| 2008-10-24 | 14072.615 |
| 2008-10-27 | 13988.533 |
| 2008-10-28 | 13768.307 |
| 2008-10-29 | 13690.082 |
| 2008-10-30 | 13680.929 |
| 2008-10-31 | 13976.33 |
| 2008-11-03 | 14105.607 |
| 2008-11-04 | 14219.184 |
| 2008-11-05 | 14163.578 |
| 2008-11-06 | 14203.299 |
| 2008-11-07 | 14197.975 |
| 2008-11-10 | 14349.028 |
| 2008-11-11 | 14373.106 |
| 2008-11-12 | 14466.49 |
| 2008-11-13 | 14638.846 |
| 2008-11-14 | 14568.766 |
| 2008-11-17 | 14607.325 |
| 2008-11-18 | 14551.072 |
| 2008-11-19 | 14790.786 |
| 2008-11-21 | 14476.72 |
| 2008-11-24 | 14352.542 |
| 2008-11-25 | 14338.591 |
| 2008-11-26 | 14374.928 |
| 2008-11-27 | 14158.483 |
| 2008-11-28 | 14296.702 |
| 2008-12-01 | 14114.697 |
| 2008-12-02 | 14004.173 |
| 2008-12-03 | 13921.821 |
| 2008-12-04 | 13765.015 |
| 2008-12-05 | 13504.17 |
| 2008-12-08 | 13790.765 |
| 2008-12-09 | 13563.148 |
| 2008-12-10 | 13526.519 |
| 2008-12-11 | 13321.553 |
| 2008-12-12 | 13277.406 |
| 2008-12-15 | 13176.445 |
| 2008-12-16 | 13328.194 |
| 2008-12-17 | 13538.147 |
| 2008-12-18 | 13613.891 |
| 2008-12-19 | 13537.745 |
| 2008-12-22 | 13671.581 |
| 2008-12-23 | 13676.457 |
| 2008-12-26 | 13961.544 |
| 2008-12-29 | 14124.728 |
| 2008-12-30 | 13938.604 |
| 2009-01-02 | 14233.23 |
| 2009-01-05 | 13896.524 |
| 2009-01-06 | 13822.558 |
| 2009-01-07 | 13803.581 |
| 2009-01-08 | 13877.55 |
| 2009-01-09 | 14131.656 |
| 2009-01-12 | 14148.336 |
| 2009-01-13 | 13981.865 |
| 2009-01-14 | 14084.621 |
| 2009-01-15 | 14200.988 |
| 2009-01-16 | 14188.325 |
| 2009-01-19 | 14175.905 |
| 2009-01-20 | 14177.416 |
| 2009-01-21 | 14245.624 |
| 2009-01-22 | 14302.396 |
| 2009-01-23 | 14425.07 |
| 2009-01-26 | 14478.056 |
| 2009-01-27 | 14414.613 |
| 2009-01-28 | 14346.119 |
| 2009-01-29 | 14230.042 |
| 2009-01-30 | 14217.989 |
| 2009-02-02 | 14300.714 |
| 2009-02-03 | 14170.695 |
| 2009-02-04 | 13939.696 |
| 2009-02-05 | 14079.542 |
| 2009-02-06 | 14066.934 |
| 2009-02-09 | 14059.261 |
| 2009-02-10 | 13974.602 |
| 2009-02-11 | 13961.16 |
| 2009-02-12 | 13873.089 |
| 2009-02-13 | 13858.898 |
| 2009-02-16 | 13844.007 |
| 2009-02-17 | 13716.463 |
| 2009-02-18 | 13630.663 |
| 2009-02-19 | 13591.455 |
| 2009-02-20 | 13525.492 |
| 2009-02-25 | 13633.258 |
| 2009-02-26 | 13503.384 |
| 2009-02-27 | 13399.727 |
| 2009-03-02 | 13261.503 |
| 2009-03-03 | 13365.7 |
| 2009-03-04 | 13299.494 |
| 2009-03-05 | 13238.638 |
| 2009-03-06 | 13208.76 |
| 2009-03-09 | 13208.846 |
| 2009-03-10 | 13171.661 |
| 2009-03-11 | 13074.819 |
| 2009-03-12 | 12989.755 |
| 2009-03-13 | 12926.32 |
| 2009-03-16 | 12997.51 |
| 2009-03-17 | 13044.167 |
| 2009-03-18 | 13147.506 |
| 2009-03-19 | 13447.561 |
| 2009-03-20 | 13434.498 |
| 2009-03-23 | 13633.729 |
| 2009-03-24 | 13562.096 |
| 2009-03-25 | 13543.035 |
| 2009-03-26 | 13496.088 |
| 2009-03-27 | 13480.847 |
| 2009-03-30 | 13511.222 |
| 2009-03-31 | 13645.331 |
| 2009-04-01 | 13596.217 |
| 2009-04-02 | 13631.971 |
| 2009-04-03 | 13645.734 |
| 2009-04-06 | 13590.97 |
| 2009-04-07 | 13624.637 |
| 2009-04-08 | 13682.466 |
| 2009-04-09 | 13681.943 |
| 2009-04-13 | 13655.901 |
| 2009-04-14 | 14765.618 |
| 2009-04-15 | 14675.726 |
| 2009-04-16 | 14688.749 |
| 2009-04-17 | 14579.195 |
| 2009-04-20 | 14659.83 |
| 2009-04-22 | 14600.473 |
| 2009-04-23 | 14611.488 |
| 2009-04-24 | 14576.033 |
| 2009-04-27 | 14598.114 |
| 2009-04-28 | 14507.89 |
| 2009-04-29 | 14531.556 |
| 2009-04-30 | 14613.393 |
| 2009-05-04 | 14723.443 |
| 2009-05-05 | 14833.466 |
| 2009-05-06 | 14729.617 |
| 2009-05-07 | 14708.441 |
| 2009-05-08 | 14715.252 |
| 2009-05-11 | 14788.91 |
| 2009-05-12 | 14958.812 |
| 2009-05-13 | 15064.953 |
| 2009-05-14 | 15091.499 |
| 2009-05-15 | 15166.688 |
| 2009-05-18 | 15262.699 |
| 2009-05-19 | 15249.032 |
| 2009-05-20 | 15340.582 |
| 2009-05-21 | 15301.046 |
| 2009-05-22 | 15424.445 |
| 2009-05-25 | 15478.884 |
| 2009-05-26 | 15476.783 |
| 2009-05-27 | 15490.07 |
| 2009-05-28 | 15541.251 |
| 2009-05-29 | 15437.064 |
| 2009-06-01 | 15485.763 |
| 2009-06-02 | 15299.61 |
| 2009-06-03 | 15230.077 |
| 2009-06-04 | 15256.354 |
| 2009-06-05 | 15209.026 |
| 2009-06-08 | 15182.454 |
| 2009-06-09 | 15113.972 |
| 2009-06-10 | 15091.277 |
| 2009-06-12 | 15033.901 |
| 2009-06-15 | 14917.99 |
| 2009-06-16 | 15084.102 |
| 2009-06-17 | 15077.454 |
| 2009-06-18 | 15208.653 |
| 2009-06-19 | 15129.559 |
| 2009-06-22 | 15251.025 |
| 2009-06-23 | 15150.507 |
| 2009-06-24 | 15127.855 |
| 2009-06-25 | 15082.059 |
| 2009-06-26 | 15060.584 |
| 2009-06-29 | 15178.374 |
| 2009-06-30 | 15134.012 |
| 2009-07-01 | 15050.246 |
| 2009-07-02 | 15051.738 |
| 2009-07-03 | 15034.445 |
| 2009-07-06 | 15168.107 |
| 2009-07-07 | 15076.597 |
| 2009-07-08 | 14944.95 |
| 2009-07-10 | 14838.8 |
| 2009-07-13 | 14675.42 |
| 2009-07-14 | 14716.631 |
| 2009-07-15 | 14646.804 |
| 2009-07-16 | 14543.506 |
| 2009-07-17 | 14686.62 |
| 2009-07-20 | 14754.131 |
| 2009-07-21 | 14710.879 |
| 2009-07-22 | 14583.189 |
| 2009-07-23 | 14528.056 |
| 2009-07-24 | 14530.381 |
| 2009-07-27 | 14499.804 |
| 2009-07-28 | 14514.365 |
| 2009-07-29 | 14551.468 |
| 2009-07-30 | 14525.916 |
| 2009-07-31 | 14556.11 |
| 2009-08-03 | 14604.808 |
| 2009-08-04 | 14439.031 |
| 2009-08-05 | 14282.091 |
| 2009-08-06 | 14400.6 |
| 2009-08-07 | 14409.293 |
| 2009-08-10 | 14454.674 |
| 2009-08-11 | 14577.065 |
| 2009-08-12 | 14571.853 |
| 2009-08-13 | 14625.9 |
| 2009-08-14 | 14608.719 |
| 2009-08-17 | 14546.518 |
| 2009-08-18 | 14430.63 |
| 2009-08-19 | 14332.473 |
| 2009-08-20 | 14380.737 |
| 2009-08-21 | 14332.689 |
| 2009-08-24 | 14324.616 |
| 2009-08-25 | 14380.307 |
| 2009-08-26 | 14432.591 |
| 2009-08-27 | 14385.658 |
| 2009-08-28 | 14443.222 |
| 2009-08-31 | 14329.674 |
| 2009-09-01 | 13407.221 |
| 2009-09-02 | 13279.92 |
| 2009-09-03 | 13150.827 |
| 2009-09-04 | 13170.906 |
| 2009-09-08 | 13113.124 |
| 2009-09-09 | 13176.854 |
| 2009-09-10 | 13062.149 |
| 2009-09-11 | 13093.14 |
| 2009-09-14 | 13198.822 |
| 2009-09-15 | 13283.504 |
| 2009-09-16 | 13186.707 |
| 2009-09-17 | 13335.335 |
| 2009-09-18 | 13409.584 |
| 2009-09-21 | 13401.36 |
| 2009-09-22 | 13484.594 |
| 2009-09-23 | 13325.843 |
| 2009-09-24 | 13255.612 |
| 2009-09-25 | 13226.163 |
| 2009-09-28 | 13249.751 |
| 2009-09-29 | 13228.247 |
| 2009-09-30 | 13267.753 |
| 2009-10-01 | 13236.512 |
| 2009-10-02 | 13183.34 |
| 2009-10-05 | 13096.942 |
| 2009-10-06 | 13090.858 |
| 2009-10-07 | 13070.078 |
| 2009-10-08 | 13092.475 |
| 2009-10-09 | 13103.017 |
| 2009-10-13 | 13187.562 |
| 2009-10-14 | 13086.243 |
| 2009-10-15 | 13049.501 |
| 2009-10-16 | 13195.815 |
| 2009-10-19 | 13300.595 |
| 2009-10-20 | 13309.676 |
| 2009-10-21 | 13243.547 |
| 2009-10-22 | 13284.689 |
| 2009-10-23 | 12998.419 |
| 2009-10-26 | 13058.792 |
| 2009-10-27 | 13014.096 |
| 2009-10-28 | 12929.406 |
| 2009-10-29 | 13011.818 |
| 2009-10-30 | 13155.449 |
| 2009-11-03 | 13266.838 |
| 2009-11-04 | 13182.741 |
| 2009-11-05 | 13161.335 |
| 2009-11-06 | 13011.639 |
| 2009-11-09 | 12937.718 |
| 2009-11-10 | 12870.033 |
| 2009-11-11 | 12835.111 |
| 2009-11-12 | 12851.802 |
| 2009-11-13 | 12758.682 |
| 2009-11-16 | 12928.172 |
| 2009-11-17 | 12902.058 |
| 2009-11-18 | 13059.565 |
| 2009-11-19 | 13018.295 |
| 2009-11-23 | 13084.404 |
| 2009-11-24 | 12918.591 |
| 2009-11-25 | 12899.536 |
| 2009-11-26 | 12835.747 |
| 2009-11-27 | 12882.353 |
| 2009-11-30 | 12881.433 |
| 2009-12-01 | 12840.298 |
| 2009-12-02 | 12902.28 |
| 2009-12-03 | 13000.738 |
| 2009-12-04 | 12976.198 |
| 2009-12-07 | 13141.735 |
| 2009-12-08 | 13207.935 |
| 2009-12-09 | 13133.7 |
| 2009-12-10 | 13183.041 |
| 2009-12-11 | 13178.619 |
| 2009-12-14 | 13354.454 |
| 2009-12-15 | 13351.661 |
| 2009-12-16 | 13290.104 |
| 2009-12-17 | 13431.337 |
| 2009-12-18 | 13374.635 |
| 2009-12-21 | 13401.544 |
| 2009-12-22 | 13326.26 |
| 2009-12-23 | 13238.711 |
| 2009-12-28 | 13140.558 |
| 2009-12-29 | 13140.767 |
| 2009-12-30 | 13176.162 |
| 2010-01-04 | 13221.464 |
| 2010-01-05 | 13172.893 |
| 2010-01-06 | 13162.062 |
| 2010-01-07 | 13151.879 |
| 2010-01-08 | 13153.467 |
| 2010-01-11 | 13189.24 |
| 2010-01-12 | 13218.793 |
| 2010-01-13 | 13280.117 |
| 2010-01-14 | 13302.113 |
| 2010-01-15 | 13252.347 |
| 2010-01-18 | 13224.213 |
| 2010-01-19 | 13177.723 |
| 2010-01-20 | 13154.33 |
| 2010-01-21 | 13265.835 |
| 2010-01-22 | 13331.454 |
| 2010-01-26 | 13290.967 |
| 2010-01-27 | 13176.402 |
| 2010-01-28 | 13254.333 |
| 2010-01-29 | 13235.098 |
| 2010-02-01 | 13253.154 |
| 2010-02-02 | 13128.25 |
| 2010-02-03 | 13051.035 |
| 2010-02-04 | 13133.209 |
| 2010-02-05 | 13150.25 |
| 2010-02-08 | 13165.05 |
| 2010-02-09 | 13130.698 |
| 2010-02-10 | 13166.304 |
| 2010-02-11 | 13215.328 |
| 2010-02-12 | 13243.556 |
| 2010-02-17 | 13237.251 |
| 2010-02-18 | 13233.402 |
| 2010-02-19 | 13192.345 |
| 2010-02-22 | 13125.298 |
| 2010-02-23 | 13224.238 |
| 2010-02-24 | 13213.913 |
| 2010-02-25 | 13257.848 |
| 2010-02-26 | 13099.729 |
| 2010-03-01 | 13066.667 |
| 2010-03-02 | 13026.524 |
| 2010-03-03 | 13045.529 |
| 2010-03-04 | 13098.223 |
| 2010-03-05 | 13100.973 |
| 2010-03-08 | 13151.748 |
| 2010-03-09 | 13172.499 |
| 2010-03-10 | 13138.098 |
| 2010-03-11 | 13084.152 |
| 2010-03-12 | 13099.819 |
| 2010-03-15 | 13022.459 |
| 2010-03-16 | 13180.812 |
| 2010-03-17 | 13214.721 |
| 2010-03-18 | 13399.874 |
| 2010-03-19 | 13376.604 |
| 2010-03-22 | 13400.892 |
| 2010-03-23 | 13376.332 |
| 2010-03-24 | 13491.922 |
| 2010-03-25 | 13633.097 |
| 2010-03-26 | 13720.066 |
| 2010-03-29 | 13742.349 |
| 2010-03-30 | 13739.144 |
| 2010-03-31 | 13629.534 |
| 2010-04-01 | 13663.823 |
| 2010-04-05 | 13762.239 |
| 2010-04-06 | 13691.73 |
| 2010-04-07 | 13745.944 |
| 2010-04-08 | 13627.014 |
| 2010-04-09 | 13522.395 |
| 2010-04-12 | 13470.764 |
| 2010-04-13 | 13517.734 |
| 2010-04-14 | 13372.085 |
| 2010-04-15 | 13366.604 |
| 2010-04-16 | 13293.907 |
| 2010-04-19 | 13268.099 |
| 2010-04-20 | 13296.462 |
| 2010-04-22 | 13262.026 |
| 2010-04-23 | 13266.146 |
| 2010-04-26 | 13198.145 |
| 2010-04-27 | 13246.505 |
| 2010-04-28 | 13241.532 |
| 2010-04-29 | 13200.419 |
| 2010-04-30 | 13310.737 |
| 2010-05-03 | 13360.449 |
| 2010-05-04 | 13372.28 |
| 2010-05-05 | 13453.257 |
| 2010-05-06 | 13551.381 |
| 2010-05-07 | 13551.568 |
| 2010-05-10 | 13278.182 |
| 2010-05-11 | 13391.679 |
| 2010-05-12 | 13405.655 |
| 2010-05-13 | 13357.151 |
| 2010-05-14 | 13369.553 |
| 2010-05-17 | 13414.424 |
| 2010-05-18 | 13511.39 |
| 2010-05-19 | 13570.658 |
| 2010-05-20 | 13650.703 |
| 2010-05-21 | 13680.505 |
| 2010-05-24 | 13656.337 |
| 2010-05-25 | 13681.806 |
| 2010-05-26 | 13685.049 |
| 2010-05-27 | 13641.624 |
| 2010-05-28 | 13592.145 |
| 2010-05-31 | 13549.299 |
| 2010-06-01 | 13678.926 |
| 2010-06-02 | 13650.639 |
| 2010-06-04 | 13654.268 |
| 2010-06-07 | 13675.063 |
| 2010-06-08 | 13624.822 |
| 2010-06-09 | 13650.059 |
| 2010-06-10 | 13547.512 |
| 2010-06-11 | 13780.351 |
| 2010-06-14 | 13893.738 |
| 2010-06-15 | 14178.129 |
| 2010-06-16 | 14196.497 |
| 2010-06-17 | 14149.181 |
| 2010-06-18 | 14258.008 |
| 2010-06-21 | 14228.884 |
| 2010-06-22 | 14305.369 |
| 2010-06-23 | 14358.069 |
| 2010-06-24 | 14588.819 |
| 2010-06-25 | 14580.141 |
| 2010-06-28 | 14592.757 |
| 2010-06-29 | 14498.801 |
| 2010-06-30 | 14543.488 |
| 2010-07-01 | 14636.209 |
| 2010-07-02 | 14441.281 |
| 2010-07-05 | 14335.264 |
| 2010-07-06 | 14202.835 |
| 2010-07-07 | 14266.004 |
| 2010-07-08 | 14293.648 |
| 2010-07-12 | 14341.746 |
| 2010-07-13 | 14411.77 |
| 2010-07-14 | 14483.291 |
| 2010-07-15 | 14694.703 |
| 2010-07-16 | 14681.932 |
| 2010-07-19 | 14605.458 |
| 2010-07-20 | 14470.89 |
| 2010-07-21 | 14613.704 |
| 2010-07-22 | 14624.668 |
| 2010-07-23 | 14845.252 |
| 2010-07-26 | 14875.968 |
| 2010-07-27 | 14844.754 |
| 2010-07-28 | 14874.222 |
| 2010-07-29 | 15070.015 |
| 2010-07-30 | 15217 |
| 2010-08-02 | 15093.305 |
| 2010-08-03 | 14992.11 |
| 2010-08-04 | 15080.567 |
| 2010-08-05 | 15118.768 |
| 2010-08-06 | 15027.822 |
| 2010-08-09 | 15100.818 |
| 2010-08-10 | 15181.156 |
| 2010-08-11 | 15286.541 |
| 2010-08-12 | 15544.82 |
| 2010-08-13 | 15576.51 |
| 2010-08-16 | 15675.9 |
| 2010-08-17 | 15557.15 |
| 2010-08-18 | 15611.931 |
| 2010-08-19 | 15783.417 |
| 2010-08-20 | 15955.559 |
| 2010-08-23 | 16005.646 |
| 2010-08-24 | 15486.803 |
| 2010-08-25 | 15420.53 |
| 2010-08-26 | 15649.282 |
| 2010-08-27 | 15987.53 |
| 2010-08-30 | 16096.808 |
| 2010-08-31 | 16046.981 |
| 2010-09-01 | 16200.569 |
| 2010-09-02 | 16159.225 |
| 2010-09-03 | 16250.062 |
| 2010-09-06 | 16193.979 |
| 2010-09-08 | 16485.898 |
| 2010-09-09 | 16455.933 |
| 2010-09-10 | 16446.946 |
| 2010-09-13 | 16519.676 |
| 2010-09-14 | 16507.245 |
| 2010-09-15 | 16447.833 |
| 2010-09-16 | 16393.714 |
| 2010-09-17 | 16350.357 |
| 2010-09-20 | 16076.969 |
| 2010-09-21 | 16067.643 |
| 2010-09-22 | 16091.733 |
| 2010-09-23 | 16145.59 |
| 2010-09-24 | 16119.63 |
| 2010-09-27 | 16126.824 |
| 2010-09-28 | 16301.394 |
| 2010-09-29 | 16124.668 |
| 2010-09-30 | 15991.751 |
| 2010-10-01 | 15857.17 |
| 2010-10-04 | 15587.952 |
| 2010-10-05 | 15742.29 |
| 2010-10-06 | 15884.358 |
| 2010-10-07 | 15834.681 |
| 2010-10-08 | 16253.081 |
| 2010-10-11 | 16226.51 |
| 2010-10-13 | 16466.72 |
| 2010-10-14 | 16678.523 |
| 2010-10-15 | 16781.027 |
| 2010-10-18 | 16872.894 |
| 2010-10-19 | 17084.239 |
| 2010-10-20 | 17430.048 |
| 2010-10-21 | 17723.729 |
| 2010-10-22 | 17981.066 |
| 2010-10-25 | 18167.782 |
| 2010-10-26 | 18191.586 |
| 2010-10-27 | 18206.716 |
| 2010-10-28 | 18082.122 |
| 2010-10-29 | 18311.738 |
| 2010-11-01 | 18251.588 |
| 2010-11-03 | 18358.718 |
| 2010-11-04 | 18492.971 |
| 2010-11-05 | 18705.311 |
| 2010-11-08 | 19103.217 |
| 2010-11-09 | 19458.933 |
| 2010-11-10 | 19230.08 |
| 2010-11-11 | 18727.267 |
| 2010-11-12 | 18138.975 |
| 2010-11-16 | 18057.688 |
| 2010-11-17 | 17672.482 |
| 2010-11-18 | 17691.45 |
| 2010-11-19 | 17899.592 |
| 2010-11-22 | 17798.535 |
| 2010-11-23 | 18083.96 |
| 2010-11-24 | 18003.79 |
| 2010-11-25 | 17715.449 |
| 2010-11-26 | 17557.245 |
| 2010-11-29 | 17550.386 |
| 2010-11-30 | 17352.154 |
| 2010-12-01 | 17437.524 |
| 2010-12-02 | 17507.928 |
| 2010-12-03 | 17545.888 |
| 2010-12-06 | 17782.428 |
| 2010-12-07 | 17722.513 |
| 2010-12-08 | 17850.703 |
| 2010-12-09 | 18064.947 |
| 2010-12-10 | 18232.864 |
| 2010-12-13 | 18472.496 |
| 2010-12-14 | 18408.044 |
| 2010-12-15 | 18181.308 |
| 2010-12-16 | 18094.471 |
| 2010-12-17 | 18363.986 |
| 2010-12-20 | 18374.777 |
| 2010-12-21 | 18711.758 |
| 2010-12-22 | 18608.956 |
| 2010-12-23 | 18836.226 |
| 2010-12-27 | 19054.976 |
| 2010-12-28 | 19085.401 |
| 2010-12-29 | 18902.306 |
| 2010-12-30 | 18735.374 |
| 2011-01-03 | 17967.756 |
| 2011-01-04 | 18055.177 |
| 2011-01-05 | 18181.831 |
| 2011-01-06 | 18145.612 |
| 2011-01-07 | 18224.86 |
| 2011-01-10 | 18341.819 |
| 2011-01-11 | 18441.441 |
| 2011-01-12 | 18617.53 |
| 2011-01-13 | 18430.363 |
| 2011-01-14 | 18466.769 |
| 2011-01-17 | 18460.341 |
| 2011-01-18 | 18393.26 |
| 2011-01-19 | 18416.462 |
| 2011-01-20 | 18387.744 |
| 2011-01-21 | 18636.475 |
| 2011-01-24 | 18667.012 |
| 2011-01-26 | 18757.395 |
| 2011-01-27 | 18752.975 |
| 2011-01-28 | 19044.179 |
| 2011-01-31 | 19162.34 |
| 2011-02-01 | 19527.093 |
| 2011-02-02 | 19480.7 |
| 2011-02-03 | 19482.98 |
| 2011-02-04 | 19468.798 |
| 2011-02-07 | 19510.892 |
| 2011-02-08 | 19381.911 |
| 2011-02-09 | 19532.587 |
| 2011-02-10 | 19679.73 |
| 2011-02-11 | 19543.46 |
| 2011-02-14 | 19595.854 |
| 2011-02-15 | 19563.381 |
| 2011-02-16 | 19437.407 |
| 2011-02-17 | 19592.792 |
| 2011-02-18 | 19836.702 |
| 2011-02-21 | 19892.492 |
| 2011-02-22 | 20033.773 |
| 2011-02-23 | 19907.594 |
| 2011-02-24 | 19669.652 |
| 2011-02-25 | 19841.544 |
| 2011-02-28 | 19909.305 |
| 2011-03-01 | 19889.697 |
| 2011-03-02 | 19857.979 |
| 2011-03-03 | 19976.618 |
| 2011-03-04 | 19863.38 |
| 2011-03-09 | 20518.589 |
| 2011-03-10 | 20250.224 |
| 2011-03-11 | 20074.721 |
| 2011-03-14 | 20010.445 |
| 2011-03-15 | 19604.676 |
| 2011-03-16 | 19821.731 |
| 2011-03-17 | 20021.058 |
| 2011-03-18 | 20131.647 |
| 2011-03-21 | 20017.838 |
| 2011-03-22 | 19803.657 |
| 2011-03-23 | 19718.258 |
| 2011-03-24 | 19544.323 |
| 2011-03-25 | 19675.913 |
| 2011-03-28 | 19506.88 |
| 2011-03-29 | 19335.105 |
| 2011-03-30 | 19253.239 |
| 2011-03-31 | 19386.482 |
| 2011-04-01 | 19219.784 |
| 2011-04-04 | 19093.485 |
| 2011-04-05 | 19368.563 |
| 2011-04-06 | 19331.368 |
| 2011-04-07 | 19374.101 |
| 2011-04-08 | 19385.877 |
| 2011-04-11 | 19412.312 |
| 2011-04-12 | 19530.799 |
| 2011-04-13 | 19665.889 |
| 2011-04-14 | 19624.188 |
| 2011-04-15 | 19688.713 |
| 2011-04-18 | 19705.47 |
| 2011-04-19 | 19735.766 |
| 2011-04-20 | 19905.512 |
| 2011-04-25 | 19693.766 |
| 2011-04-26 | 19812.075 |
| 2011-04-27 | 19730.649 |
| 2011-04-28 | 19842.479 |
| 2011-04-29 | 19718.983 |
| 2011-05-02 | 19904.894 |
| 2011-05-03 | 20084.868 |
| 2011-05-04 | 19696.414 |
| 2011-05-05 | 19571.371 |
| 2011-05-06 | 19349.37 |
| 2011-05-09 | 19465.801 |
| 2011-05-10 | 19273.633 |
| 2011-05-11 | 18933.535 |
| 2011-05-12 | 18921.776 |
| 2011-05-13 | 18780.232 |
| 2011-05-16 | 18603.846 |
| 2011-05-17 | 18643.741 |
| 2011-05-18 | 18717.009 |
| 2011-05-19 | 18647.792 |
| 2011-05-20 | 18536 |
| 2011-05-23 | 18699.045 |
| 2011-05-24 | 18556.106 |
| 2011-05-25 | 18905.79 |
| 2011-05-26 | 18882.947 |
| 2011-05-27 | 18845.241 |
| 2011-05-30 | 18766.946 |
| 2011-05-31 | 18586.364 |
| 2011-06-01 | 18487.561 |
| 2011-06-02 | 18453.783 |
| 2011-06-03 | 18876.011 |
| 2011-06-06 | 18693.576 |
| 2011-06-07 | 18761.221 |
| 2011-06-08 | 18790.296 |
| 2011-06-09 | 18828.499 |
| 2011-06-10 | 18776.085 |
| 2011-06-13 | 18786.683 |
| 2011-06-14 | 18655.468 |
| 2011-06-15 | 18525.082 |
| 2011-06-16 | 18458.46 |
| 2011-06-17 | 18087.2 |
| 2011-06-20 | 17884.14 |
| 2011-06-21 | 17976.153 |
| 2011-06-22 | 17887.263 |
| 2011-06-24 | 18075.731 |
| 2011-06-27 | 18186.286 |
| 2011-06-28 | 18313.928 |
| 2011-06-29 | 18325.018 |
| 2011-06-30 | 18214.387 |
| 2011-07-01 | 18188.211 |
| 2011-07-04 | 18250.809 |
| 2011-07-05 | 18411.402 |
| 2011-07-06 | 18264.176 |
| 2011-07-07 | 18314.819 |
| 2011-07-08 | 18187.828 |
| 2011-07-11 | 18189.365 |
| 2011-07-12 | 18184.233 |
| 2011-07-13 | 18407.678 |
| 2011-07-14 | 18358.204 |
| 2011-07-15 | 18298.868 |
| 2011-07-18 | 18263.479 |
| 2011-07-19 | 18177.185 |
| 2011-07-20 | 18155.903 |
| 2011-07-21 | 18142.921 |
| 2011-07-22 | 18240.447 |
| 2011-07-25 | 18185.641 |
| 2011-07-26 | 18218.15 |
| 2011-07-27 | 18271.651 |
| 2011-07-28 | 18267.066 |
| 2011-07-29 | 18164.017 |
| 2011-08-01 | 18205.196 |
| 2011-08-02 | 18341.924 |
| 2011-08-03 | 18203.12 |
| 2011-08-04 | 18017.78 |
| 2011-08-05 | 18183.15 |
| 2011-08-08 | 18028.696 |
| 2011-08-09 | 18177.197 |
| 2011-08-10 | 18113.449 |
| 2011-08-11 | 18339.604 |
| 2011-08-12 | 18319.256 |
| 2011-08-15 | 18322.485 |
| 2011-08-16 | 18489.731 |
| 2011-08-17 | 18922.661 |
| 2011-08-18 | 19015.976 |
| 2011-08-19 | 19149.958 |
| 2011-08-22 | 19262.281 |
| 2011-08-23 | 19383.883 |
| 2011-08-24 | 19440.049 |
| 2011-08-25 | 19504.024 |
| 2011-08-26 | 19620.706 |
| 2011-08-29 | 19694.393 |
| 2011-08-30 | 19894.932 |
| 2011-08-31 | 19845.807 |
| 2011-09-01 | 21638.447 |
| 2011-09-02 | 21804.591 |
| 2011-09-05 | 21720.417 |
| 2011-09-06 | 21677.576 |
| 2011-09-08 | 21777.303 |
| 2011-09-09 | 21437.028 |
| 2011-09-12 | 21727.545 |
| 2011-09-13 | 21710.292 |
| 2011-09-14 | 21487.385 |
| 2011-09-15 | 21266.659 |
| 2011-09-16 | 21248.83 |
| 2011-09-19 | 21716.455 |
| 2011-09-20 | 21757.213 |
| 2011-09-21 | 21864.516 |
| 2011-09-22 | 21547.35 |
| 2011-09-23 | 21179.427 |
| 2011-09-26 | 21429.239 |
| 2011-09-27 | 21347.486 |
| 2011-09-28 | 21207.734 |
| 2011-09-29 | 21201.984 |
| 2011-09-30 | 21215.225 |
| 2011-10-03 | 21004.858 |
| 2011-10-04 | 21299.898 |
| 2011-10-05 | 21147.732 |
| 2011-10-06 | 21154.99 |
| 2011-10-07 | 20865.449 |
| 2011-10-10 | 20862.615 |
| 2011-10-11 | 20882.07 |
| 2011-10-13 | 21198.728 |
| 2011-10-14 | 21113.489 |
| 2011-10-17 | 21105.072 |
| 2011-10-18 | 20981.715 |
| 2011-10-19 | 21209.869 |
| 2011-10-20 | 21235.628 |
| 2011-10-21 | 21596.654 |
| 2011-10-24 | 21742.229 |
| 2011-10-25 | 21541.233 |
| 2011-10-26 | 21544.853 |
| 2011-10-27 | 21283.075 |
| 2011-10-28 | 21181.521 |
| 2011-10-31 | 21099.037 |
| 2011-11-01 | 21322.289 |
| 2011-11-03 | 21532.534 |
| 2011-11-04 | 21608.387 |
| 2011-11-07 | 21802.086 |
| 2011-11-08 | 21675.925 |
| 2011-11-09 | 21632.312 |
| 2011-11-10 | 21685.842 |
| 2011-11-11 | 21675.582 |
| 2011-11-14 | 21700.764 |
| 2011-11-16 | 21701.591 |
| 2011-11-17 | 21449.147 |
| 2011-11-18 | 21423.695 |
| 2011-11-21 | 21452.198 |
| 2011-11-22 | 21462.754 |
| 2011-11-23 | 21451.665 |
| 2011-11-24 | 21271.224 |
| 2011-11-25 | 21338.463 |
| 2011-11-28 | 21086.332 |
| 2011-11-29 | 21064.048 |
| 2011-11-30 | 21313.899 |
| 2011-12-01 | 21248.751 |
| 2011-12-02 | 21004.355 |
| 2011-12-05 | 21063.375 |
| 2011-12-06 | 21052.396 |
| 2011-12-07 | 20837.991 |
| 2011-12-08 | 20752.046 |
| 2011-12-09 | 20688.571 |
| 2011-12-12 | 20616.884 |
| 2011-12-13 | 20556.494 |
| 2011-12-14 | 20348.086 |
| 2011-12-15 | 20119.618 |
| 2011-12-16 | 19944.781 |
| 2011-12-19 | 20127.629 |
| 2011-12-20 | 20329.67 |
| 2011-12-21 | 20342.652 |
| 2011-12-22 | 20371.45 |
| 2011-12-23 | 20334.063 |
| 2011-12-26 | 20433.286 |
| 2011-12-27 | 20552.39 |
| 2011-12-28 | 20718.828 |
| 2011-12-29 | 20585.072 |
| 2012-01-02 | 19781.451 |
| 2012-01-03 | 19686.411 |
| 2012-01-04 | 19635.703 |
| 2012-01-05 | 19368.592 |
| 2012-01-06 | 19512.056 |
| 2012-01-09 | 19459.766 |
| 2012-01-10 | 19410.131 |
| 2012-01-11 | 19627.736 |
| 2012-01-12 | 19382.526 |
| 2012-01-13 | 19282.433 |
| 2012-01-16 | 19272.425 |
| 2012-01-17 | 19322.347 |
| 2012-01-18 | 19179.294 |
| 2012-01-19 | 19180.361 |
| 2012-01-20 | 19127.293 |
| 2012-01-23 | 18967.246 |
| 2012-01-24 | 19038.257 |
| 2012-01-26 | 18853.43 |
| 2012-01-27 | 18750.772 |
| 2012-01-30 | 18744.899 |
| 2012-01-31 | 18688.622 |
| 2012-02-01 | 18541.47 |
| 2012-02-02 | 18479.237 |
| 2012-02-03 | 18500.133 |
| 2012-02-06 | 18518.198 |
| 2012-02-07 | 18604.479 |
| 2012-02-08 | 18582.143 |
| 2012-02-09 | 18484.369 |
| 2012-02-10 | 18431.363 |
| 2012-02-13 | 18317.265 |
| 2012-02-14 | 17943.117 |
| 2012-02-15 | 17763.906 |
| 2012-02-16 | 17687.121 |
| 2012-02-17 | 17668.403 |
| 2012-02-22 | 17699.438 |
| 2012-02-23 | 17745.534 |
| 2012-02-24 | 17771.271 |
| 2012-02-27 | 17809.582 |
| 2012-02-28 | 17826.39 |
| 2012-02-29 | 17759.125 |
| 2012-03-01 | 17682.056 |
| 2012-03-02 | 17670.354 |
| 2012-03-05 | 17705.618 |
| 2012-03-06 | 17478.879 |
| 2012-03-07 | 17380.69 |
| 2012-03-08 | 17383.066 |
| 2012-03-09 | 17368.563 |
| 2012-03-12 | 17487.973 |
| 2012-03-13 | 17542.925 |
| 2012-03-14 | 17519 |
| 2012-03-15 | 17556.239 |
| 2012-03-16 | 17439.96 |
| 2012-03-19 | 17458.696 |
| 2012-03-20 | 17479.711 |
| 2012-03-21 | 17550.509 |
| 2012-03-22 | 17238.147 |
| 2012-03-23 | 17342.668 |
| 2012-03-26 | 17430.179 |
| 2012-03-27 | 17660.557 |
| 2012-03-28 | 17560.157 |
| 2012-03-29 | 17371.827 |
| 2012-03-30 | 17662.629 |
| 2012-04-02 | 17838.157 |
| 2012-04-03 | 17833.827 |
| 2012-04-04 | 17857.988 |
| 2012-04-05 | 17729.557 |
| 2012-04-09 | 17524.892 |
| 2012-04-10 | 17529.963 |
| 2012-04-11 | 17525.429 |
| 2012-04-12 | 17506.116 |
| 2012-04-13 | 17404.692 |
| 2012-04-16 | 17216.269 |
| 2012-04-17 | 17157.037 |
| 2012-04-18 | 17246.579 |
| 2012-04-19 | 17319.081 |
| 2012-04-20 | 17385.152 |
| 2012-04-23 | 17413.772 |
| 2012-04-24 | 17725.137 |
| 2012-04-25 | 17469.34 |
| 2012-04-26 | 17357.179 |
| 2012-04-27 | 17418.054 |
| 2012-04-30 | 17583.894 |
| 2012-05-02 | 17590.157 |
| 2012-05-03 | 17397.663 |
| 2012-05-04 | 17305.154 |
| 2012-05-07 | 17245.874 |
| 2012-05-08 | 17331.97 |
| 2012-05-09 | 17363.382 |
| 2012-05-10 | 17388.281 |
| 2012-05-11 | 17266.784 |
| 2012-05-14 | 17483.328 |
| 2012-05-15 | 17548.643 |
| 2012-05-16 | 17600.784 |
| 2012-05-17 | 17666.832 |
| 2012-05-18 | 17808.049 |
| 2012-05-21 | 17780.254 |
| 2012-05-22 | 17765.095 |
| 2012-05-23 | 17423.729 |
| 2012-05-24 | 17391.808 |
| 2012-05-25 | 17228.998 |
| 2012-05-28 | 17143.785 |
| 2012-05-29 | 17055.091 |
| 2012-05-30 | 17050.515 |
| 2012-05-31 | 16891.464 |
| 2012-06-01 | 16840.411 |
| 2012-06-04 | 16908.052 |
| 2012-06-05 | 16760.873 |
| 2012-06-06 | 16742.007 |
| 2012-06-08 | 16747.646 |
| 2012-06-11 | 16846.361 |
| 2012-06-12 | 16865.395 |
| 2012-06-13 | 16806.572 |
| 2012-06-14 | 16628.281 |
| 2012-06-15 | 16584.984 |
| 2012-06-18 | 16706.766 |
| 2012-06-19 | 16982.419 |
| 2012-06-20 | 16771.436 |
| 2012-06-21 | 17037.903 |
| 2012-06-22 | 17095.637 |
| 2012-06-25 | 17175.583 |
| 2012-06-26 | 17489.891 |
| 2012-06-27 | 17516.381 |
| 2012-06-28 | 17467.156 |
| 2012-06-29 | 17443.102 |
| 2012-07-02 | 17470.342 |
| 2012-07-03 | 17734.111 |
| 2012-07-04 | 17855.94 |
| 2012-07-05 | 17949.415 |
| 2012-07-06 | 17944.011 |
| 2012-07-10 | 18250.729 |
| 2012-07-11 | 18224.828 |
| 2012-07-12 | 18183.52 |
| 2012-07-13 | 18450.858 |
| 2012-07-16 | 18533.083 |
| 2012-07-17 | 18463.015 |
| 2012-07-18 | 18484.35 |
| 2012-07-19 | 18822.078 |
| 2012-07-20 | 18983.016 |
| 2012-07-23 | 18777.12 |
| 2012-07-24 | 18308.527 |
| 2012-07-25 | 18499.802 |
| 2012-07-26 | 18334.421 |
| 2012-07-27 | 18409.035 |
| 2012-07-30 | 18743.39 |
| 2012-07-31 | 18653.21 |
| 2012-08-01 | 18624.337 |
| 2012-08-02 | 18450.453 |
| 2012-08-03 | 18443.3 |
| 2012-08-06 | 18540.728 |
| 2012-08-07 | 18460.411 |
| 2012-08-08 | 18354.159 |
| 2012-08-09 | 18217.331 |
| 2012-08-10 | 18503.538 |
| 2012-08-13 | 18218.329 |
| 2012-08-14 | 18214.477 |
| 2012-08-15 | 18130.849 |
| 2012-08-16 | 18147.364 |
| 2012-08-17 | 18318.574 |
| 2012-08-20 | 18520.47 |
| 2012-08-21 | 18609.901 |
| 2012-08-22 | 18528.608 |
| 2012-08-23 | 18570.273 |
| 2012-08-24 | 18634.911 |
| 2012-08-27 | 18796.244 |
| 2012-08-28 | 18844.668 |
| 2012-08-29 | 18846.951 |
| 2012-08-30 | 18814.888 |
| 2012-08-31 | 18641.735 |
| 2012-09-03 | 18747.836 |
| 2012-09-04 | 18869.69 |
| 2012-09-05 | 18670.078 |
| 2012-09-06 | 18634.15 |
| 2012-09-10 | 18920.275 |
| 2012-09-11 | 18911.892 |
| 2012-09-12 | 18773.087 |
| 2012-09-13 | 18718.15 |
| 2012-09-14 | 18820.264 |
| 2012-09-17 | 18616.716 |
| 2012-09-18 | 18707.61 |
| 2012-09-19 | 18618.953 |
| 2012-09-20 | 18352.628 |
| 2012-09-21 | 18539.222 |
| 2012-09-24 | 18434.55 |
| 2012-09-25 | 18380.667 |
| 2012-09-26 | 18100.046 |
| 2012-09-27 | 18153.182 |
| 2012-09-28 | 18271.039 |
| 2012-10-01 | 18290.809 |
| 2012-10-02 | 18406.844 |
| 2012-10-03 | 18305.224 |
| 2012-10-04 | 18208.366 |
| 2012-10-05 | 17969.205 |
| 2012-10-08 | 17982.561 |
| 2012-10-09 | 17855.308 |
| 2012-10-10 | 17837.369 |
| 2012-10-11 | 17862.338 |
| 2012-10-15 | 17778.054 |
| 2012-10-16 | 17886.553 |
| 2012-10-17 | 17853.02 |
| 2012-10-18 | 17803.591 |
| 2012-10-19 | 17959.781 |
| 2012-10-22 | 18052.983 |
| 2012-10-23 | 17944.693 |
| 2012-10-24 | 17950.302 |
| 2012-10-25 | 18107.174 |
| 2012-10-26 | 18038.391 |
| 2012-10-29 | 18112.087 |
| 2012-10-30 | 17986.991 |
| 2012-10-31 | 17988.711 |
| 2012-11-01 | 17928.383 |
| 2012-11-05 | 17790.437 |
| 2012-11-06 | 17764.028 |
| 2012-11-07 | 17806.668 |
| 2012-11-08 | 17791.624 |
| 2012-11-09 | 17652.186 |
| 2012-11-12 | 17722.313 |
| 2012-11-13 | 17544.283 |
| 2012-11-14 | 17581.436 |
| 2012-11-16 | 17621.437 |
| 2012-11-19 | 17804.798 |
| 2012-11-21 | 17843.103 |
| 2012-11-22 | 17734.68 |
| 2012-11-23 | 17665.522 |
| 2012-11-26 | 17614.737 |
| 2012-11-27 | 17592.902 |
| 2012-11-28 | 17736.409 |
| 2012-11-29 | 17939.487 |
| 2012-11-30 | 17725.899 |
| 2012-12-03 | 17782.85 |
| 2012-12-04 | 17641.09 |
| 2012-12-05 | 17602.124 |
| 2012-12-06 | 17474.59 |
| 2012-12-07 | 17532.213 |
| 2012-12-10 | 17231.82 |
| 2012-12-11 | 17290.323 |
| 2012-12-12 | 17176.086 |
| 2012-12-13 | 17116.203 |
| 2012-12-14 | 17101.752 |
| 2012-12-17 | 17255.866 |
| 2012-12-18 | 17104.253 |
| 2012-12-19 | 16997.735 |
| 2012-12-20 | 16869.095 |
| 2012-12-21 | 17022.485 |
| 2012-12-26 | 17051.002 |
| 2012-12-27 | 17027.994 |
| 2012-12-28 | 16931.434 |
| 2013-01-02 | 16862.647 |
| 2013-01-03 | 16729.621 |
| 2013-01-04 | 16776.489 |
| 2013-01-07 | 16816.797 |
| 2013-01-08 | 16844.188 |
| 2013-01-09 | 16793.932 |
| 2013-01-10 | 16797.855 |
| 2013-01-11 | 16945.42 |
| 2013-01-14 | 17027.995 |
| 2013-01-15 | 16989.74 |
| 2013-01-16 | 17034.147 |
| 2013-01-17 | 17088.799 |
| 2013-01-18 | 17108.354 |
| 2013-01-21 | 17115.624 |
| 2013-01-22 | 16969.997 |
| 2013-01-23 | 16970.578 |
| 2013-01-24 | 16827.212 |
| 2013-01-28 | 16739.006 |
| 2013-01-29 | 16703.814 |
| 2013-01-30 | 16769.09 |
| 2013-01-31 | 16801.097 |
| 2013-02-01 | 16919.792 |
| 2013-02-04 | 16904.911 |
| 2013-02-05 | 16844.113 |
| 2013-02-06 | 16771.333 |
| 2013-02-07 | 16656.028 |
| 2013-02-08 | 16676.288 |
| 2013-02-13 | 16602.852 |
| 2013-02-14 | 16563.087 |
| 2013-02-15 | 16488.992 |
| 2013-02-18 | 16341.644 |
| 2013-02-19 | 16269.017 |
| 2013-02-20 | 16224.328 |
| 2013-02-21 | 16173.82 |
| 2013-02-22 | 16250.706 |
| 2013-02-25 | 16241.789 |
| 2013-02-26 | 16370.01 |
| 2013-02-27 | 16299.476 |
| 2013-02-28 | 16257.942 |
| 2013-03-01 | 16261.522 |
| 2013-03-04 | 16360.302 |
| 2013-03-05 | 16214.941 |
| 2013-03-06 | 16230.199 |
| 2013-03-07 | 16243.277 |
| 2013-03-08 | 16274.062 |
| 2013-03-11 | 16274.771 |
| 2013-03-12 | 16259.48 |
| 2013-03-13 | 16164.846 |
| 2013-03-14 | 16161.418 |
| 2013-03-15 | 16053.149 |
| 2013-03-18 | 15894.513 |
| 2013-03-19 | 15856.785 |
| 2013-03-20 | 15853.723 |
| 2013-03-21 | 15916.195 |
| 2013-03-22 | 15987.959 |
| 2013-03-25 | 16019.269 |
| 2013-03-26 | 16131.596 |
| 2013-03-27 | 16070.654 |
| 2013-03-28 | 16036.802 |
| 2013-04-01 | 15968.672 |
| 2013-04-02 | 15962.014 |
| 2013-04-03 | 16055.143 |
| 2013-04-04 | 16006.132 |
| 2013-04-05 | 15958.934 |
| 2013-04-08 | 15882.678 |
| 2013-04-09 | 15915.204 |
| 2013-04-10 | 15887.128 |
| 2013-04-11 | 15890.255 |
| 2013-04-12 | 15835.898 |
| 2013-04-15 | 15852.329 |
| 2013-04-16 | 15932.754 |
| 2013-04-17 | 15903.957 |
| 2013-04-18 | 16028.525 |
| 2013-04-19 | 16066.29 |
| 2013-04-22 | 16081.237 |
| 2013-04-23 | 15860.582 |
| 2013-04-24 | 15789.249 |
| 2013-04-25 | 15767.576 |
| 2013-04-26 | 15656.204 |
| 2013-04-29 | 15800.36 |
| 2013-04-30 | 15841.197 |
| 2013-05-02 | 15929.669 |
| 2013-05-03 | 15950.307 |
| 2013-05-06 | 15872.616 |
| 2013-05-07 | 15801.916 |
| 2013-05-08 | 15834.527 |
| 2013-05-09 | 15960.452 |
| 2013-05-10 | 15894.588 |
| 2013-05-13 | 15965.659 |
| 2013-05-14 | 15986.918 |
| 2013-05-15 | 15888.616 |
| 2013-05-16 | 15882.345 |
| 2013-05-17 | 15897.28 |
| 2013-05-20 | 15898.129 |
| 2013-05-21 | 15852.545 |
| 2013-05-22 | 15881.963 |
| 2013-05-23 | 15936.469 |
| 2013-05-24 | 15919.255 |
| 2013-05-27 | 15881.298 |
| 2013-05-28 | 15981.903 |
| 2013-05-29 | 16151.218 |
| 2013-05-31 | 16303.892 |
| 2013-06-03 | 16330.522 |
| 2013-06-04 | 16283.676 |
| 2013-06-05 | 16256.389 |
| 2013-06-06 | 16263.428 |
| 2013-06-07 | 16229.166 |
| 2013-06-10 | 16184.728 |
| 2013-06-11 | 16194.993 |
| 2013-06-12 | 16066.626 |
| 2013-06-13 | 16079.319 |
| 2013-06-14 | 16084.288 |
| 2013-06-17 | 16127.465 |
| 2013-06-18 | 16205.322 |
| 2013-06-19 | 16300.254 |
| 2013-06-20 | 16393.773 |
| 2013-06-21 | 16370.813 |
| 2013-06-24 | 16335.625 |
| 2013-06-25 | 16367.552 |
| 2013-06-26 | 16310.599 |
| 2013-06-27 | 16330.08 |
| 2013-06-28 | 16366.425 |
| 2013-07-01 | 16315.56 |
| 2013-07-02 | 16422.783 |
| 2013-07-03 | 16416.257 |
| 2013-07-04 | 16405.626 |
| 2013-07-05 | 16325.504 |
| 2013-07-08 | 16421.988 |
| 2013-07-10 | 16509.989 |
| 2013-07-11 | 16526.537 |
| 2013-07-12 | 16381.664 |
| 2013-07-15 | 16372.648 |
| 2013-07-16 | 16441.176 |
| 2013-07-17 | 16292.884 |
| 2013-07-18 | 16199.352 |
| 2013-07-19 | 16146.028 |
| 2013-07-22 | 16245.26 |
| 2013-07-23 | 16173.196 |
| 2013-07-24 | 16112.63 |
| 2013-07-25 | 16058.562 |
| 2013-07-26 | 16036.273 |
| 2013-07-29 | 15972.912 |
| 2013-07-30 | 15960.534 |
| 2013-07-31 | 15873.269 |
| 2013-08-01 | 15767.734 |
| 2013-08-02 | 15773.055 |
| 2013-08-05 | 15828.964 |
| 2013-08-06 | 15783.457 |
| 2013-08-07 | 15866.75 |
| 2013-08-08 | 15857.314 |
| 2013-08-09 | 15862.48 |
| 2013-08-12 | 15936.765 |
| 2013-08-13 | 15930.607 |
| 2013-08-14 | 16030.372 |
| 2013-08-15 | 16171.971 |
| 2013-08-16 | 16427.107 |
| 2013-08-19 | 16684.667 |
| 2013-08-20 | 16493.218 |
| 2013-08-21 | 16644.482 |
| 2013-08-22 | 16614.941 |
| 2013-08-23 | 16521.25 |
| 2013-08-26 | 16838.781 |
| 2013-08-27 | 16720.646 |
| 2013-08-28 | 16677.236 |
| 2013-08-29 | 16765.795 |
| 2013-08-30 | 16799.917 |
| 2013-09-02 | 16926.794 |
| 2013-09-03 | 16915.235 |
| 2013-09-04 | 16943.495 |
| 2013-09-05 | 16833.897 |
| 2013-09-06 | 16808.014 |
| 2013-09-09 | 16792.851 |
| 2013-09-10 | 16771.499 |
| 2013-09-11 | 16856.435 |
| 2013-09-12 | 16849.236 |
| 2013-09-13 | 16881.972 |
| 2013-09-16 | 16929.226 |
| 2013-09-17 | 16887.832 |
| 2013-09-18 | 16844.58 |
| 2013-09-19 | 16899.719 |
| 2013-09-20 | 16927.116 |
| 2013-09-23 | 16900.744 |
| 2013-09-24 | 16873.393 |
| 2013-09-25 | 17065.114 |
| 2013-09-26 | 17116.18 |
| 2013-09-27 | 17098.49 |
| 2013-09-30 | 16942.595 |
| 2013-10-01 | 16951.499 |
| 2013-10-02 | 16882.337 |
| 2013-10-03 | 16875.105 |
| 2013-10-04 | 16803.618 |
| 2013-10-07 | 16916.658 |
| 2013-10-08 | 16939.505 |
| 2013-10-09 | 16938.013 |
| 2013-10-10 | 16786.857 |
| 2013-10-11 | 16724.075 |
| 2013-10-14 | 16752.404 |
| 2013-10-15 | 16714.206 |
| 2013-10-16 | 16530.658 |
| 2013-10-17 | 16539.203 |
| 2013-10-18 | 16538.492 |
| 2013-10-21 | 16545.32 |
| 2013-10-22 | 16568.538 |
| 2013-10-23 | 16582.404 |
| 2013-10-24 | 16560.879 |
| 2013-10-25 | 16479.909 |
| 2013-10-28 | 16468.372 |
| 2013-10-29 | 16485.749 |
| 2013-10-30 | 16421.305 |
| 2013-10-31 | 16474.486 |
| 2013-11-01 | 16503.248 |
| 2013-11-04 | 16521.878 |
| 2013-11-05 | 16596.937 |
| 2013-11-06 | 16625.764 |
| 2013-11-07 | 16651.161 |
| 2013-11-08 | 16769.228 |
| 2013-11-11 | 16900.271 |
| 2013-11-12 | 16972.182 |
| 2013-11-13 | 16932.43 |
| 2013-11-14 | 16912.16 |
| 2013-11-18 | 16856.101 |
| 2013-11-19 | 16868.29 |
| 2013-11-21 | 17097.02 |
| 2013-11-22 | 17028.371 |
| 2013-11-25 | 17087.353 |
| 2013-11-26 | 17126.818 |
| 2013-11-27 | 17165.812 |
| 2013-11-28 | 17249.03 |
| 2013-11-29 | 17363.268 |
| 2013-12-02 | 17322.723 |
| 2013-12-03 | 17466.107 |
| 2013-12-04 | 17503.952 |
| 2013-12-05 | 17450.326 |
| 2013-12-06 | 17502.427 |
| 2013-12-09 | 17605.373 |
| 2013-12-10 | 17535.243 |
| 2013-12-11 | 17632.543 |
| 2013-12-12 | 17657.205 |
| 2013-12-13 | 17662.941 |
| 2013-12-16 | 17727.435 |
| 2013-12-17 | 17691.605 |
| 2013-12-18 | 17652.542 |
| 2013-12-19 | 17633.202 |
| 2013-12-20 | 17656.961 |
| 2013-12-23 | 17699.5 |
| 2013-12-26 | 17797.992 |
| 2013-12-27 | 17805.211 |
| 2013-12-30 | 17753.691 |
| 2014-01-02 | 17864.779 |
| 2014-01-03 | 17955.368 |
| 2014-01-06 | 18083.078 |
| 2014-01-07 | 17900.462 |
| 2014-01-08 | 17923.278 |
| 2014-01-09 | 17857.562 |
| 2014-01-10 | 17849.191 |
| 2014-01-13 | 17802.424 |
| 2014-01-14 | 17802.476 |
| 2014-01-15 | 17745.446 |
| 2014-01-16 | 17798.592 |
| 2014-01-17 | 17715.946 |
| 2014-01-20 | 17656.677 |
| 2014-01-21 | 17565.392 |
| 2014-01-22 | 17469.847 |
| 2014-01-23 | 17651.615 |
| 2014-01-24 | 17694.226 |
| 2014-01-27 | 17782.503 |
| 2014-01-28 | 17807.299 |
| 2014-01-29 | 18025.758 |
| 2014-01-30 | 18122.825 |
| 2014-01-31 | 18318.702 |
| 2014-02-03 | 18599.196 |
| 2014-02-04 | 18715.978 |
| 2014-02-05 | 18863.813 |
| 2014-02-06 | 18743.825 |
| 2014-02-07 | 18801.384 |
| 2014-02-10 | 18848.492 |
| 2014-02-11 | 18890.222 |
| 2014-02-12 | 19083.152 |
| 2014-02-13 | 19171.247 |
| 2014-02-14 | 19095.978 |
| 2014-02-17 | 19294.834 |
| 2014-02-18 | 19587.702 |
| 2014-02-19 | 20004.277 |
| 2014-02-20 | 19914.224 |
| 2014-02-21 | 19847.523 |
| 2014-02-24 | 20200.526 |
| 2014-02-25 | 20239.589 |
| 2014-02-26 | 20247.915 |
| 2014-02-27 | 20070.055 |
| 2014-02-28 | 20125.375 |
| 2014-03-05 | 20570.507 |
| 2014-03-06 | 20731.642 |
| 2014-03-07 | 20867.898 |
| 2014-03-10 | 20915.33 |
| 2014-03-11 | 20825.906 |
| 2014-03-12 | 20519.25 |
| 2014-03-13 | 20825.906 |
| 2014-03-14 | 20519.25 |
| 2014-03-17 | 20475.286 |
| 2014-03-18 | 20629.052 |
| 2014-03-19 | 20384.8 |
| 2014-03-20 | 19981.796 |
| 2014-03-21 | 19862.442 |
| 2014-03-24 | 20083.282 |
| 2014-03-25 | 19986.847 |
| 2014-03-26 | 20082.83 |
| 2014-03-27 | 19874.109 |
| 2014-03-28 | 19904.919 |
| 2014-03-31 | 19841.986 |
| 2014-04-01 | 19991.164 |
| 2014-04-02 | 19863.324 |
| 2014-04-03 | 19954.585 |
| 2014-04-04 | 20152 |
| 2014-04-07 | 20300.545 |
| 2014-04-08 | 20244.009 |
| 2014-04-09 | 20175.888 |
| 2014-04-10 | 20230.638 |
| 2014-04-11 | 20123.07 |
| 2014-04-14 | 20224.275 |
| 2014-04-15 | 20162.6 |
| 2014-04-16 | 20096.291 |
| 2014-04-17 | 20268.865 |
| 2014-04-22 | 20321.588 |
| 2014-04-23 | 20170.831 |
| 2014-04-24 | 20281.621 |
| 2014-04-25 | 20194.433 |
| 2014-04-28 | 20076.2 |
| 2014-04-29 | 20207.052 |
| 2014-04-30 | 19998.977 |
| 2014-05-02 | 20051.773 |
| 2014-05-05 | 20310.366 |
| 2014-05-06 | 20219.434 |
| 2014-05-07 | 20146.3 |
| 2014-05-08 | 20027.4 |
| 2014-05-09 | 19889.202 |
| 2014-05-12 | 19874.085 |
| 2014-05-13 | 19821.174 |
| 2014-05-14 | 19760.22 |
| 2014-05-15 | 19954.408 |
| 2014-05-16 | 19681.993 |
| 2014-05-19 | 19577.673 |
| 2014-05-20 | 19573.078 |
| 2014-05-21 | 19447.735 |
| 2014-05-22 | 19488.927 |
| 2014-05-23 | 19539.144 |
| 2014-05-26 | 19596.924 |
| 2014-05-27 | 19591.299 |
| 2014-05-28 | 19675.878 |
| 2014-05-29 | 19777.678 |
| 2014-05-30 | 19769.805 |
| 2014-06-02 | 19771.328 |
| 2014-06-03 | 19723.354 |
| 2014-06-04 | 19797.071 |
| 2014-06-05 | 19732.914 |
| 2014-06-06 | 19740.962 |
| 2014-06-09 | 19499.582 |
| 2014-06-10 | 19446.615 |
| 2014-06-11 | 19543.4 |
| 2014-06-13 | 19579.702 |
| 2014-06-16 | 19572.887 |
| 2014-06-17 | 19620.43 |
| 2014-06-18 | 19529.504 |
| 2014-06-20 | 19581.075 |
| 2014-06-23 | 19604.194 |
| 2014-06-24 | 19545.739 |
| 2014-06-25 | 19546.401 |
| 2014-06-26 | 19513.911 |
| 2014-06-27 | 19343.579 |
| 2014-06-30 | 19300.787 |
| 2014-07-01 | 19122.168 |
| 2014-07-02 | 19173.23 |
| 2014-07-03 | 19115.22 |
| 2014-07-04 | 19011.091 |
| 2014-07-07 | 18969.765 |
| 2014-07-08 | 18918.254 |
| 2014-07-10 | 18985.45 |
| 2014-07-11 | 18722.405 |
| 2014-07-14 | 18797.298 |
| 2014-07-15 | 18728.123 |
| 2014-07-16 | 18705.005 |
| 2014-07-17 | 18710.058 |
| 2014-07-18 | 18704.897 |
| 2014-07-21 | 18694.901 |
| 2014-07-22 | 18481.88 |
| 2014-07-23 | 18944.828 |
| 2014-07-24 | 18689.816 |
| 2014-07-25 | 18758.231 |
| 2014-07-28 | 18833.402 |
| 2014-07-29 | 18847.821 |
| 2014-07-30 | 18992.492 |
| 2014-07-31 | 19269.818 |
| 2014-08-01 | 19240.935 |
| 2014-08-04 | 19256.904 |
| 2014-08-05 | 19284.572 |
| 2014-08-06 | 19327.231 |
| 2014-08-07 | 19300.422 |
| 2014-08-08 | 19164.396 |
| 2014-08-11 | 19228.701 |
| 2014-08-12 | 19269.738 |
| 2014-08-13 | 19336.759 |
| 2014-08-14 | 19452.763 |
| 2014-08-15 | 19599.602 |
| 2014-08-18 | 19727.332 |
| 2014-08-19 | 19750.791 |
| 2014-08-20 | 19702.891 |
| 2014-08-21 | 19698.64 |
| 2014-08-22 | 19712.957 |
| 2014-08-25 | 19764.544 |
| 2014-08-26 | 19934.912 |
| 2014-08-27 | 19961.58 |
| 2014-08-28 | 19913.889 |
| 2014-08-29 | 19996.998 |
| 2014-09-01 | 20159.309 |
| 2014-09-02 | 20162.143 |
| 2014-09-03 | 19886.48 |
| 2014-09-04 | 19880.947 |
| 2014-09-05 | 19820.265 |
| 2014-09-08 | 19754.765 |
| 2014-09-09 | 19900.405 |
| 2014-09-10 | 19716.749 |
| 2014-09-11 | 19734.762 |
| 2014-09-12 | 19836.109 |
| 2014-09-15 | 19771.507 |
| 2014-09-16 | 19728.75 |
| 2014-09-17 | 19784.799 |
| 2014-09-18 | 19794.259 |
| 2014-09-19 | 19734.889 |
| 2014-09-22 | 19741.42 |
| 2014-09-23 | 19821.14 |
| 2014-09-24 | 20031.089 |
| 2014-09-25 | 20007.917 |
| 2014-09-26 | 20060.474 |
| 2014-09-29 | 20304.148 |
| 2014-09-30 | 20263.033 |
| 2014-10-01 | 20482.255 |
| 2014-10-02 | 20702.614 |
| 2014-10-03 | 20639.835 |
| 2014-10-06 | 20893.503 |
| 2014-10-07 | 20744.909 |
| 2014-10-08 | 20676.899 |
| 2014-10-09 | 21019.337 |
| 2014-10-10 | 21004.619 |
| 2014-10-13 | 21112.667 |
| 2014-10-14 | 21515.061 |
| 2014-10-15 | 21438.769 |
| 2014-10-16 | 21663.784 |
| 2014-10-17 | 21566.517 |
| 2014-10-20 | 21426.698 |
| 2014-10-21 | 21455.413 |
| 2014-10-22 | 21589.372 |
| 2014-10-23 | 21853.117 |
| 2014-10-24 | 21774.284 |
| 2014-10-27 | 21774.671 |
| 2014-10-28 | 21901.709 |
| 2014-10-29 | 22156.044 |
| 2014-10-30 | 21943.259 |
| 2014-10-31 | 22120.142 |
| 2014-11-03 | 22022.881 |
| 2014-11-04 | 22073.009 |
| 2014-11-05 | 22166.541 |
| 2014-11-06 | 22508.304 |
| 2014-11-07 | 22484.255 |
| 2014-11-10 | 22354.385 |
| 2014-11-11 | 22541.405 |
| 2014-11-12 | 22571.475 |
| 2014-11-13 | 22762.646 |
| 2014-11-14 | 22777.416 |
| 2014-11-17 | 22831.217 |
| 2014-11-18 | 22905.231 |
| 2014-11-19 | 23015.363 |
| 2014-11-21 | 22721.075 |
| 2014-11-24 | 22673.232 |
| 2014-11-25 | 22766.596 |
| 2014-11-26 | 22663.503 |
| 2014-11-27 | 22616.993 |
| 2014-11-28 | 22747.222 |
| 2014-12-01 | 22738.841 |
| 2014-12-02 | 22570.386 |
| 2014-12-03 | 22342.249 |
| 2014-12-04 | 22299.295 |
| 2014-12-05 | 22347.068 |
| 2014-12-08 | 22293.588 |
| 2014-12-09 | 22378.733 |
| 2014-12-10 | 22239.588 |
| 2014-12-11 | 22299.721 |
| 2014-12-12 | 22318.682 |
| 2014-12-15 | 22400.934 |
| 2014-12-16 | 22407.05 |
| 2014-12-17 | 22215.343 |
| 2014-12-18 | 22152.153 |
| 2014-12-19 | 22175.761 |
| 2014-12-22 | 22018.599 |
| 2014-12-23 | 22221.245 |
| 2014-12-26 | 22131.268 |
| 2014-12-29 | 22298.579 |
| 2014-12-30 | 22171.762 |
| 2015-01-02 | 22003.714 |
| 2015-01-05 | 22329.61 |
| 2015-01-06 | 22369.625 |
| 2015-01-07 | 22237.525 |
| 2015-01-08 | 22259.735 |
| 2015-01-09 | 22355.874 |
| 2015-01-12 | 22501.081 |
| 2015-01-13 | 22357.674 |
| 2015-01-14 | 22279.626 |
| 2015-01-15 | 22234.012 |
| 2015-01-16 | 22196.213 |
| 2015-01-19 | 22115.087 |
| 2015-01-20 | 21848.787 |
| 2015-01-21 | 21703.07 |
| 2015-01-22 | 21525.562 |
| 2015-01-23 | 21612.327 |
| 2015-01-26 | 21572.343 |
| 2015-01-27 | 21712.781 |
| 2015-01-28 | 21710.401 |
| 2015-01-29 | 21665.307 |
| 2015-01-30 | 21959.003 |
| 2015-02-02 | 22007.95 |
| 2015-02-03 | 22015.444 |
| 2015-02-04 | 22260.931 |
| 2015-02-05 | 22187.943 |
| 2015-02-06 | 22350.818 |
| 2015-02-09 | 22364.547 |
| 2015-02-10 | 22255.563 |
| 2015-02-11 | 22335.371 |
| 2015-02-12 | 22322.271 |
| 2015-02-13 | 22369.236 |
| 2015-02-18 | 22274.966 |
| 2015-02-19 | 22294.465 |
| 2015-02-20 | 22397.101 |
| 2015-02-23 | 22184.31 |
| 2015-02-24 | 22263.815 |
| 2015-02-25 | 22133.191 |
| 2015-02-26 | 22111.777 |
| 2015-02-27 | 22075.161 |
| 2015-03-02 | 22010.102 |
| 2015-03-03 | 21856.989 |
| 2015-03-04 | 22237.345 |
| 2015-03-05 | 22248.561 |
| 2015-03-06 | 22410.654 |
| 2015-03-09 | 22617.774 |
| 2015-03-10 | 22427.191 |
| 2015-03-11 | 22377.149 |
| 2015-03-12 | 22505.322 |
| 2015-03-13 | 22642.858 |
| 2015-03-16 | 22778.072 |
| 2015-03-17 | 22786.557 |
| 2015-03-18 | 22728.008 |
| 2015-03-19 | 23260.815 |
| 2015-03-20 | 23037.789 |
| 2015-03-23 | 22787.145 |
| 2015-03-24 | 22593.704 |
| 2015-03-25 | 22762.648 |
| 2015-03-26 | 22833.026 |
| 2015-03-27 | 22838.119 |
| 2015-03-30 | 22684.21 |
| 2015-03-31 | 22652.537 |
| 2015-04-01 | 22680.275 |
| 2015-04-02 | 22801.138 |
| 2015-04-06 | 23024.433 |
| 2015-04-07 | 22962.689 |
| 2015-04-08 | 22926.042 |
| 2015-04-09 | 22683.768 |
| 2015-04-10 | 22632.439 |
| 2015-04-13 | 22601.828 |
| 2015-04-14 | 22476.74 |
| 2015-04-15 | 22462.885 |
| 2015-04-16 | 22506.983 |
| 2015-04-17 | 22731.234 |
| 2015-04-20 | 22665.12 |
| 2015-04-22 | 22644.572 |
| 2015-04-23 | 22389.722 |
| 2015-04-24 | 22227.401 |
| 2015-04-27 | 21967.997 |
| 2015-04-28 | 21922.501 |
| 2015-04-29 | 21855.399 |
| 2015-04-30 | 21914.191 |
| 2015-05-04 | 22038.91 |
| 2015-05-05 | 21949.478 |
| 2015-05-06 | 21903.63 |
| 2015-05-07 | 21923.177 |
| 2015-05-08 | 21945.339 |
| 2015-05-11 | 22015.218 |
| 2015-05-12 | 21933.068 |
| 2015-05-13 | 21965.509 |
| 2015-05-14 | 21951.332 |
| 2015-05-15 | 21938.838 |
| 2015-05-18 | 22236.624 |
| 2015-05-19 | 22129.889 |
| 2015-05-20 | 22042.137 |
| 2015-05-21 | 21800.947 |
| 2015-05-22 | 21839.072 |
| 2015-05-25 | 21908.461 |
| 2015-05-26 | 21764.788 |
| 2015-05-27 | 21629.295 |
| 2015-05-28 | 21795.182 |
| 2015-05-29 | 21813.716 |
| 2015-06-01 | 21953.945 |
| 2015-06-02 | 21993.326 |
| 2015-06-03 | 22117.216 |
| 2015-06-05 | 22128.868 |
| 2015-06-08 | 22229.21 |
| 2015-06-09 | 22216.573 |
| 2015-06-10 | 22091.598 |
| 2015-06-11 | 21929.273 |
| 2015-06-12 | 21821.269 |
| 2015-06-15 | 21696.304 |
| 2015-06-16 | 21722.881 |
| 2015-06-17 | 21618.579 |
| 2015-06-18 | 21766.84 |
| 2015-06-19 | 21741.004 |
| 2015-06-22 | 21852.05 |
| 2015-06-23 | 21749.849 |
| 2015-06-24 | 21816.594 |
| 2015-06-25 | 21837.084 |
| 2015-06-26 | 21942.023 |
| 2015-06-29 | 21811.812 |
| 2015-06-30 | 21766.274 |
| 2015-07-01 | 21762.773 |
| 2015-07-02 | 21679.969 |
| 2015-07-03 | 21640.64 |
| 2015-07-06 | 21548.528 |
| 2015-07-07 | 21577.945 |
| 2015-07-08 | 21665.516 |
| 2015-07-10 | 21729.425 |
| 2015-07-13 | 21770.423 |
| 2015-07-14 | 21891.43 |
| 2015-07-15 | 21559.026 |
| 2015-07-16 | 21633.366 |
| 2015-07-17 | 21595.472 |
| 2015-07-20 | 21490.729 |
| 2015-07-21 | 21291.62 |
| 2015-07-22 | 21439.334 |
| 2015-07-23 | 21606.037 |
| 2015-07-24 | 21754.463 |
| 2015-07-27 | 21604.121 |
| 2015-07-28 | 21768.35 |
| 2015-07-29 | 21722.023 |
| 2015-07-30 | 21886.944 |
| 2015-07-31 | 21872.886 |
| 2015-08-03 | 21917.972 |
| 2015-08-04 | 22093.96 |
| 2015-08-05 | 22194.436 |
| 2015-08-06 | 22300.366 |
| 2015-08-07 | 22345.325 |
| 2015-08-10 | 22578.482 |
| 2015-08-11 | 22684.296 |
| 2015-08-12 | 22539.793 |
| 2015-08-13 | 22856.432 |
| 2015-08-14 | 22889.133 |
| 2015-08-17 | 22829.368 |
| 2015-08-18 | 22708.538 |
| 2015-08-19 | 22883.698 |
| 2015-08-20 | 22784 |
| 2015-08-21 | 22609.887 |
| 2015-08-24 | 22569.711 |
| 2015-08-25 | 22652.611 |
| 2015-08-26 | 22596.42 |
| 2015-08-27 | 22669.372 |
| 2015-08-28 | 22797.246 |
| 2015-08-31 | 22917.773 |
| 2015-09-01 | 22962.975 |
| 2015-09-02 | 23124.526 |
| 2015-09-03 | 23108.425 |
| 2015-09-04 | 23272.017 |
| 2015-09-08 | 23173.417 |
| 2015-09-09 | 23053.288 |
| 2015-09-10 | 23162.939 |
| 2015-09-11 | 23307.242 |
| 2015-09-14 | 23543.372 |
| 2015-09-15 | 23577.139 |
| 2015-09-16 | 23466.624 |
| 2015-09-17 | 23482.816 |
| 2015-09-18 | 23838.377 |
| 2015-09-21 | 23933.388 |
| 2015-09-22 | 23847.146 |
| 2015-09-23 | 23959.608 |
| 2015-09-24 | 24015.73 |
| 2015-09-25 | 23877.066 |
| 2015-09-28 | 24032.463 |
| 2015-09-29 | 24182.101 |
| 2015-09-30 | 24154.048 |
| 2015-10-01 | 24173.789 |
| 2015-10-02 | 24133.855 |
| 2015-10-05 | 24211.777 |
| 2015-10-06 | 24090.014 |
| 2015-10-07 | 24024.234 |
| 2015-10-08 | 23901.005 |
| 2015-10-09 | 23833.597 |
| 2015-10-13 | 24273.018 |
| 2015-10-14 | 24446.87 |
| 2015-10-15 | 24305.909 |
| 2015-10-16 | 24121.666 |
| 2015-10-19 | 24187.062 |
| 2015-10-20 | 24282.557 |
| 2015-10-21 | 24285.043 |
| 2015-10-22 | 24251.772 |
| 2015-10-23 | 24074.724 |
| 2015-10-26 | 23989.638 |
| 2015-10-27 | 24050.525 |
| 2015-10-28 | 24125.708 |
| 2015-10-29 | 24217.201 |
| 2015-10-30 | 24126.894 |
| 2015-11-03 | 23834.641 |
| 2015-11-04 | 23843.099 |
| 2015-11-05 | 23779.976 |
| 2015-11-06 | 23685.992 |
| 2015-11-09 | 23676.715 |
| 2015-11-10 | 23713.378 |
| 2015-11-11 | 23679.462 |
| 2015-11-12 | 23565.256 |
| 2015-11-13 | 23537.686 |
| 2015-11-16 | 23756.259 |
| 2015-11-17 | 23654.227 |
| 2015-11-18 | 23481.832 |
| 2015-11-19 | 23546.457 |
| 2015-11-23 | 23582.451 |
| 2015-11-24 | 23646.698 |
| 2015-11-25 | 23758.94 |
| 2015-11-26 | 23749.608 |
| 2015-11-27 | 23636.613 |
| 2015-11-30 | 23831.03 |
| 2015-12-01 | 23707.848 |
| 2015-12-02 | 23750.044 |
| 2015-12-03 | 23699.035 |
| 2015-12-04 | 23878.97 |
| 2015-12-07 | 23827.841 |
| 2015-12-08 | 23957.065 |
| 2015-12-09 | 23912.528 |
| 2015-12-10 | 24032.099 |
| 2015-12-11 | 24045.554 |
| 2015-12-14 | 24020.413 |
| 2015-12-15 | 24060.367 |
| 2015-12-16 | 24140.014 |
| 2015-12-17 | 24145.283 |
| 2015-12-18 | 24296.61 |
| 2015-12-21 | 24409.242 |
| 2015-12-22 | 24446.228 |
| 2015-12-23 | 24433.971 |
| 2015-12-28 | 24225.362 |
| 2015-12-29 | 24366.904 |
| 2015-12-30 | 24701.086 |
| 2016-01-04 | 25582.211 |
| 2016-01-05 | 25639.417 |
| 2016-01-06 | 25495.96 |
| 2016-01-07 | 25699.086 |
| 2016-01-08 | 25755.997 |
| 2016-01-11 | 25561.23 |
| 2016-01-12 | 25743.469 |
| 2016-01-13 | 25859.508 |
| 2016-01-14 | 25921.889 |
| 2016-01-15 | 25940.841 |
| 2016-01-18 | 25880.06 |
| 2016-01-19 | 25996.575 |
| 2016-01-20 | 25899.728 |
| 2016-01-21 | 26036.103 |
| 2016-01-22 | 25997.246 |
| 2016-01-26 | 25962.399 |
| 2016-01-27 | 26147.424 |
| 2016-01-28 | 26114.102 |
| 2016-01-29 | 25871.875 |
| 2016-02-01 | 25895.576 |
| 2016-02-02 | 26132.015 |
| 2016-02-03 | 26162.365 |
| 2016-02-04 | 26207.318 |
| 2016-02-05 | 26119.918 |
| 2016-02-10 | 25801.647 |
| 2016-02-11 | 25867.047 |
| 2016-02-12 | 26170.822 |
| 2016-02-15 | 26186.852 |
| 2016-02-16 | 26267.123 |
| 2016-02-17 | 26147.413 |
| 2016-02-18 | 26148.503 |
| 2016-02-19 | 26145.832 |
| 2016-02-22 | 26145.685 |
| 2016-02-23 | 26176.382 |
| 2016-02-24 | 26241.988 |
| 2016-02-25 | 26258.592 |
| 2016-02-26 | 26237.915 |
| 2016-02-29 | 26163.419 |
| 2016-03-01 | 26029.181 |
| 2016-03-02 | 25822.825 |
| 2016-03-03 | 25832.376 |
| 2016-03-04 | 25965.322 |
| 2016-03-07 | 26033.599 |
| 2016-03-08 | 26214.179 |
| 2016-03-09 | 26338.146 |
| 2016-03-10 | 26338.42 |
| 2016-03-11 | 26728.494 |
| 2016-03-14 | 26705.68 |
| 2016-03-15 | 26749.22 |
| 2016-03-16 | 26390.434 |
| 2016-03-17 | 26099.758 |
| 2016-03-18 | 26089.221 |
| 2016-03-21 | 26235.888 |
| 2016-03-22 | 26503.749 |
| 2016-03-23 | 26513.596 |
| 2016-03-24 | 26524.041 |
| 2016-03-28 | 26471.666 |
| 2016-03-29 | 26335.057 |
| 2016-03-30 | 26479.021 |
| 2016-03-31 | 26241.566 |
| 2016-04-01 | 26144.263 |
| 2016-04-04 | 26193.8 |
| 2016-04-05 | 26090.321 |
| 2016-04-06 | 25999.101 |
| 2016-04-07 | 26030.166 |
| 2016-04-08 | 25931.282 |
| 2016-04-11 | 25950.44 |
| 2016-04-12 | 25790.081 |
| 2016-04-13 | 25718.97 |
| 2016-04-14 | 25803.761 |
| 2016-04-15 | 25806.243 |
| 2016-04-18 | 25842.9 |
| 2016-04-19 | 25961.955 |
| 2016-04-20 | 26127.962 |
| 2016-04-22 | 25920.957 |
| 2016-04-25 | 25883.483 |
| 2016-04-26 | 25796.103 |
| 2016-04-27 | 25686.302 |
| 2016-04-28 | 25682.34 |
| 2016-04-29 | 25738.074 |
| 2016-05-02 | 25882.357 |
| 2016-05-03 | 26044.474 |
| 2016-05-04 | 26053.395 |
| 2016-05-05 | 26115.139 |
| 2016-05-06 | 26169.841 |
| 2016-05-09 | 26368.486 |
| 2016-05-10 | 26419.72 |
| 2016-05-11 | 26386.314 |
| 2016-05-12 | 26537.017 |
| 2016-05-13 | 26683.719 |
| 2016-05-16 | 26322.604 |
| 2016-05-17 | 26484.506 |
| 2016-05-18 | 26588.999 |
| 2016-05-19 | 26538.651 |
| 2016-05-20 | 26351.223 |
| 2016-05-23 | 26071.789 |
| 2016-05-24 | 26051.815 |
| 2016-05-25 | 26129.797 |
| 2016-05-27 | 26236.492 |
| 2016-05-30 | 26032.657 |
| 2016-05-31 | 26096.717 |
| 2016-06-01 | 26141.96 |
| 2016-06-02 | 26148.134 |
| 2016-06-03 | 26254.649 |
| 2016-06-06 | 26409.796 |
| 2016-06-07 | 26311.931 |
| 2016-06-08 | 26494.359 |
| 2016-06-09 | 26341.375 |
| 2016-06-10 | 26548.192 |
| 2016-06-13 | 26654.255 |
| 2016-06-14 | 26619.065 |
| 2016-06-15 | 26616.513 |
| 2016-06-16 | 26696.32 |
| 2016-06-17 | 26828.239 |
| 2016-06-20 | 26692.361 |
| 2016-06-21 | 26315.818 |
| 2016-06-22 | 26192.477 |
| 2016-06-23 | 26127.058 |
| 2016-06-24 | 25806.258 |
| 2016-06-27 | 25860.379 |
| 2016-06-28 | 25913.15 |
| 2016-06-29 | 25677.46 |
| 2016-06-30 | 25415.312 |
| 2016-07-01 | 25587.931 |
| 2016-07-04 | 25639.486 |
| 2016-07-05 | 25676.153 |
| 2016-07-06 | 25627.799 |
| 2016-07-07 | 25772.491 |
| 2016-07-08 | 26042.64 |
| 2016-07-11 | 26215.38 |
| 2016-07-12 | 26299.53 |
| 2016-07-13 | 26477.797 |
| 2016-07-14 | 26632.896 |
| 2016-07-15 | 26556.731 |
| 2016-07-18 | 26724.228 |
| 2016-07-19 | 26649.216 |
| 2016-07-20 | 26610.86 |
| 2016-07-21 | 26767.15 |
| 2016-07-22 | 26588.984 |
| 2016-07-25 | 26682.271 |
| 2016-07-26 | 26794.25 |
| 2016-07-27 | 26789.175 |
| 2016-07-28 | 26583.555 |
| 2016-07-29 | 26495.788 |
| 2016-08-01 | 26521.846 |
| 2016-08-02 | 26223.6 |
| 2016-08-03 | 26175.958 |
| 2016-08-04 | 25933.098 |
| 2016-08-05 | 25965.424 |
| 2016-08-08 | 25968.067 |
| 2016-08-09 | 25960.454 |
| 2016-08-10 | 25733.899 |
| 2016-08-11 | 25381.109 |
| 2016-08-12 | 25455.34 |
| 2016-08-15 | 25603.314 |
| 2016-08-16 | 25719.385 |
| 2016-08-17 | 25621.807 |
| 2016-08-18 | 25666.051 |
| 2016-08-19 | 25560.101 |
| 2016-08-22 | 25685.644 |
| 2016-08-23 | 25606.724 |
| 2016-08-24 | 25517.677 |
| 2016-08-25 | 25518.388 |
| 2016-08-26 | 25591.295 |
| 2016-08-29 | 25591.67 |
| 2016-08-30 | 25420.911 |
| 2016-08-31 | 25216.379 |
| 2016-09-01 | 24975.639 |
| 2016-09-02 | 25163.658 |
| 2016-09-05 | 25091.581 |
| 2016-09-06 | 25450.034 |
| 2016-09-08 | 25482.984 |
| 2016-09-09 | 25443.867 |
| 2016-09-12 | 25495.947 |
| 2016-09-13 | 25530.09 |
| 2016-09-14 | 25555.259 |
| 2016-09-15 | 25469.799 |
| 2016-09-16 | 25430.083 |
| 2016-09-19 | 25723.617 |
| 2016-09-20 | 25946.535 |
| 2016-09-21 | 25916.838 |
| 2016-09-22 | 25809.178 |
| 2016-09-23 | 25689.261 |
| 2016-09-26 | 25794.392 |
| 2016-09-27 | 25886.532 |
| 2016-09-28 | 25831.72 |
| 2016-09-29 | 25956.108 |
| 2016-09-30 | 26229.271 |
| 2016-10-03 | 26201.93 |
| 2016-10-04 | 26186.132 |
| 2016-10-05 | 26103.405 |
| 2016-10-06 | 25950.072 |
| 2016-10-07 | 25936.208 |
| 2016-10-10 | 26027.71 |
| 2016-10-11 | 26017.406 |
| 2016-10-13 | 26030.477 |
| 2016-10-14 | 26129.005 |
| 2016-10-17 | 26010.222 |
| 2016-10-18 | 25937.396 |
| 2016-10-19 | 25783.252 |
| 2016-10-20 | 25738.555 |
| 2016-10-21 | 25694.081 |
| 2016-10-24 | 25628.321 |
| 2016-10-25 | 25701.934 |
| 2016-10-26 | 25692.106 |
| 2016-10-27 | 25834.42 |
| 2016-10-28 | 26176.265 |
| 2016-10-31 | 26080.523 |
| 2016-11-01 | 25977.312 |
| 2016-11-03 | 26003.355 |
| 2016-11-04 | 26002.451 |
| 2016-11-07 | 25969.458 |
| 2016-11-08 | 25667.398 |
| 2016-11-09 | 25697.238 |
| 2016-11-10 | 25714.245 |
| 2016-11-11 | 25658.386 |
| 2016-11-14 | 25857.795 |
| 2016-11-16 | 25852.885 |
| 2016-11-17 | 25665.926 |
| 2016-11-18 | 25507.095 |
| 2016-11-21 | 25467.715 |
| 2016-11-22 | 25565.878 |
| 2016-11-23 | 25494.928 |
| 2016-11-24 | 25483.564 |
| 2016-11-25 | 25387.845 |
| 2016-11-28 | 25276.653 |
| 2016-11-29 | 25020.554 |
| 2016-11-30 | 25004.643 |
| 2016-12-01 | 25069.091 |
| 2016-12-02 | 25062.444 |
| 2016-12-05 | 25029.314 |
| 2016-12-06 | 24986.431 |
| 2016-12-07 | 24933.093 |
| 2016-12-08 | 24846.152 |
| 2016-12-09 | 24788.109 |
| 2016-12-12 | 24930.088 |
| 2016-12-13 | 24988.799 |
| 2016-12-14 | 25155.753 |
| 2016-12-15 | 25135.649 |
| 2016-12-16 | 25093.216 |
| 2016-12-19 | 25215.104 |
| 2016-12-20 | 25153.786 |
| 2016-12-21 | 25078.196 |
| 2016-12-22 | 24784.811 |
| 2016-12-23 | 24659.505 |
| 2016-12-26 | 24668.459 |
| 2016-12-27 | 24672.442 |
| 2016-12-28 | 24638.459 |
| 2016-12-29 | 24534.428 |
| 2017-01-02 | 24456.512 |
| 2017-01-03 | 24528.964 |
| 2017-01-04 | 24370.552 |
| 2017-01-05 | 24251.132 |
| 2017-01-06 | 24346.194 |
| 2017-01-09 | 24273.087 |
| 2017-01-10 | 24295.769 |
| 2017-01-11 | 24313.696 |
| 2017-01-12 | 24431.569 |
| 2017-01-13 | 24410.843 |
| 2017-01-16 | 24380.909 |
| 2017-01-17 | 24438.405 |
| 2017-01-18 | 24525.219 |
| 2017-01-19 | 24357.619 |
| 2017-01-20 | 24247.874 |
| 2017-01-23 | 24477.216 |
| 2017-01-24 | 24320.624 |
| 2017-01-26 | 24183.918 |
| 2017-01-27 | 24174.395 |
| 2017-01-30 | 23930.627 |
| 2017-01-31 | 23901.071 |
| 2017-02-01 | 23860.715 |
| 2017-02-02 | 23613.743 |
| 2017-02-03 | 23596.638 |
| 2017-02-06 | 23569.474 |
| 2017-02-07 | 23491.137 |
| 2017-02-08 | 23420.163 |
| 2017-02-09 | 23566.452 |
| 2017-02-10 | 23661.544 |
| 2017-02-13 | 23587.95 |
| 2017-02-14 | 23395.395 |
| 2017-02-15 | 23137.946 |
| 2017-02-16 | 23178.091 |
| 2017-02-17 | 23276.127 |
| 2017-02-20 | 23233.814 |
| 2017-02-21 | 23324.673 |
| 2017-02-22 | 23257.794 |
| 2017-02-23 | 23401.09 |
| 2017-02-24 | 23159.051 |
| 2017-03-01 | 22947.668 |
| 2017-03-02 | 23033.287 |
| 2017-03-03 | 22763.607 |
| 2017-03-06 | 22611.115 |
| 2017-03-07 | 22423.731 |
| 2017-03-08 | 22576.899 |
| 2017-03-09 | 22552.794 |
| 2017-03-10 | 22609.09 |
| 2017-03-13 | 22671.031 |
| 2017-03-14 | 22684.666 |
| 2017-03-15 | 22687.936 |
| 2017-03-16 | 22606.596 |
| 2017-03-17 | 22497.764 |
| 2017-03-20 | 22351.358 |
| 2017-03-21 | 22302.433 |
| 2017-03-22 | 21867.252 |
| 2017-03-23 | 21805.21 |
| 2017-03-24 | 21644.54 |
| 2017-03-27 | 22056.087 |
| 2017-03-28 | 21948.387 |
| 2017-03-29 | 21685.607 |
| 2017-03-30 | 21591.264 |
| 2017-03-31 | 21544.737 |
| 2017-04-03 | 21313.692 |
| 2017-04-04 | 21227.354 |
| 2017-04-05 | 21174.75 |
| 2017-04-06 | 21290.387 |
| 2017-04-07 | 21364.97 |
| 2017-04-10 | 21454.697 |
| 2017-04-11 | 21406.005 |
| 2017-04-12 | 21395.452 |
| 2017-04-13 | 21420.03 |
| 2017-04-17 | 21579.451 |
| 2017-04-18 | 21727.758 |
| 2017-04-19 | 21550.619 |
| 2017-04-20 | 21264.168 |
| 2017-04-24 | 21192.802 |
| 2017-04-25 | 21227.51 |
| 2017-04-26 | 21132.38 |
| 2017-04-27 | 21089.585 |
| 2017-04-28 | 21237.726 |
| 2017-05-02 | 21361.406 |
| 2017-05-03 | 21303.807 |
| 2017-05-04 | 21188.311 |
| 2017-05-05 | 21138.387 |
| 2017-05-08 | 21216.549 |
| 2017-05-09 | 21129.88 |
| 2017-05-10 | 21157.141 |
| 2017-05-11 | 21109.834 |
| 2017-05-12 | 21090.362 |
| 2017-05-15 | 21008.366 |
| 2017-05-16 | 20805.688 |
| 2017-05-17 | 20998.728 |
| 2017-05-18 | 21202.745 |
| 2017-05-19 | 21147.059 |
| 2017-05-22 | 20704.648 |
| 2017-05-23 | 20702.687 |
| 2017-05-24 | 20539.459 |
| 2017-05-25 | 20632.356 |
| 2017-05-26 | 20645.889 |
| 2017-05-29 | 20640.893 |
| 2017-05-30 | 20580.458 |
| 2017-05-31 | 20310.026 |
| 2017-06-01 | 20131.925 |
| 2017-06-02 | 20055.21 |
| 2017-06-05 | 20198.464 |
| 2017-06-06 | 19962.005 |
| 2017-06-07 | 20006.942 |
| 2017-06-08 | 20039.844 |
| 2017-06-09 | 20035.951 |
| 2017-06-12 | 20013.975 |
| 2017-06-13 | 20005.989 |
| 2017-06-14 | 19954.194 |
| 2017-06-16 | 19818.093 |
| 2017-06-19 | 19705.467 |
| 2017-06-20 | 19439.306 |
| 2017-06-21 | 19216.355 |
| 2017-06-22 | 19101.501 |
| 2017-06-23 | 19276.988 |
| 2017-06-26 | 19383.704 |
| 2017-06-27 | 19533.573 |
| 2017-06-28 | 19439.799 |
| 2017-06-29 | 19586.854 |
| 2017-06-30 | 19608.203 |
| 2017-07-03 | 19740.233 |
| 2017-07-04 | 19855.09 |
| 2017-07-05 | 19813.437 |
| 2017-07-06 | 19559.789 |
| 2017-07-07 | 19629.514 |
| 2017-07-10 | 19798.466 |
| 2017-07-11 | 19929.82 |
| 2017-07-12 | 19844.07 |
| 2017-07-13 | 19862.268 |
| 2017-07-14 | 20016.856 |
| 2017-07-17 | 20025.844 |
| 2017-07-18 | 20223.187 |
| 2017-07-19 | 20362.194 |
| 2017-07-20 | 20581.741 |
| 2017-07-21 | 20677.414 |
| 2017-07-24 | 20697.932 |
| 2017-07-25 | 20514.559 |
| 2017-07-26 | 20588.361 |
| 2017-07-27 | 20703.97 |
| 2017-07-28 | 20999.341 |
| 2017-07-31 | 20985.273 |
| 2017-08-01 | 20986.655 |
| 2017-08-02 | 21123.202 |
| 2017-08-03 | 21113.445 |
| 2017-08-04 | 21063.146 |
| 2017-08-07 | 21296.288 |
| 2017-08-08 | 21253.694 |
| 2017-08-09 | 21227.617 |
| 2017-08-10 | 21198.881 |
| 2017-08-11 | 21330.35 |
| 2017-08-14 | 21344.97 |
| 2017-08-15 | 21430.324 |
| 2017-08-16 | 21359.763 |
| 2017-08-17 | 21505.332 |
| 2017-08-18 | 21652.533 |
| 2017-08-21 | 21645.78 |
| 2017-08-22 | 21463.119 |
| 2017-08-23 | 21372.114 |
| 2017-08-24 | 21471.171 |
| 2017-08-25 | 21676.292 |
| 2017-08-28 | 21792.488 |
| 2017-08-29 | 21791.262 |
| 2017-08-30 | 21698.202 |
| 2017-08-31 | 21850.469 |
| 2017-09-01 | 22164.103 |
| 2017-09-04 | 22288.752 |
| 2017-09-05 | 22375.571 |
| 2017-09-06 | 22418.602 |
| 2017-09-08 | 22548.76 |
| 2017-09-11 | 22601.264 |
| 2017-09-12 | 22653.952 |
| 2017-09-13 | 22656.001 |
| 2017-09-14 | 22567.479 |
| 2017-09-15 | 22710.528 |
| 2017-09-18 | 22653.246 |
| 2017-09-19 | 22406.401 |
| 2017-09-20 | 22549.954 |
| 2017-09-21 | 22623.373 |
| 2017-09-22 | 22626.469 |
| 2017-09-25 | 22728.753 |
| 2017-09-26 | 22660.988 |
| 2017-09-27 | 22733.304 |
| 2017-09-28 | 22682.766 |
| 2017-09-29 | 22557.545 |
| 2017-10-02 | 22467.932 |
| 2017-10-03 | 22430.464 |
| 2017-10-04 | 22334.915 |
| 2017-10-05 | 22357.777 |
| 2017-10-06 | 22467.003 |
| 2017-10-09 | 22594.114 |
| 2017-10-10 | 22687.711 |
| 2017-10-11 | 22560.809 |
| 2017-10-13 | 22577.366 |
| 2017-10-16 | 22541.226 |
| 2017-10-17 | 22506.072 |
| 2017-10-18 | 22429.445 |
| 2017-10-19 | 22340.183 |
| 2017-10-20 | 22338.077 |
| 2017-10-23 | 22616.301 |
| 2017-10-24 | 22686.202 |
| 2017-10-25 | 22552.067 |
| 2017-10-26 | 22703.64 |
| 2017-10-27 | 22756.084 |
| 2017-10-30 | 22908.992 |
| 2017-10-31 | 23024.913 |
| 2017-11-01 | 22983.94 |
| 2017-11-03 | 23164.534 |
| 2017-11-06 | 23184.083 |
| 2017-11-07 | 23106.688 |
| 2017-11-08 | 22992.807 |
| 2017-11-09 | 23016.071 |
| 2017-11-10 | 23135.629 |
| 2017-11-13 | 23267.349 |
| 2017-11-14 | 23358.1 |
| 2017-11-16 | 23367.023 |
| 2017-11-17 | 23275.885 |
| 2017-11-21 | 23184.475 |
| 2017-11-22 | 23227.948 |
| 2017-11-23 | 23344.83 |
| 2017-11-24 | 23407.857 |
| 2017-11-27 | 23433.207 |
| 2017-11-28 | 23491.575 |
| 2017-11-29 | 23657.61 |
| 2017-11-30 | 23582.309 |
| 2017-12-01 | 23579.846 |
| 2017-12-04 | 23661.213 |
| 2017-12-05 | 23686.2 |
| 2017-12-06 | 23607.853 |
| 2017-12-07 | 23631.062 |
| 2017-12-08 | 23552.546 |
| 2017-12-11 | 23477.729 |
| 2017-12-12 | 23575.093 |
| 2017-12-13 | 23696.287 |
| 2017-12-14 | 23759.343 |
| 2017-12-15 | 23755.128 |
| 2017-12-18 | 23781.873 |
| 2017-12-19 | 23860.885 |
| 2017-12-20 | 23870.973 |
| 2017-12-21 | 23793.188 |
| 2017-12-22 | 23760.557 |
| 2017-12-26 | 23838.82 |
| 2017-12-27 | 23930.16 |
| 2017-12-28 | 23937.764 |
| 2018-01-02 | 24164.276 |
| 2018-01-03 | 24106.021 |
| 2018-01-04 | 24065.455 |
| 2018-01-05 | 23962.02 |
| 2018-01-08 | 23823.625 |
| 2018-01-09 | 23766.735 |
| 2018-01-10 | 23658.782 |
| 2018-01-11 | 23590.719 |
| 2018-01-12 | 23538.08 |
| 2018-01-15 | 23467.474 |
| 2018-01-16 | 23406.981 |
| 2018-01-17 | 23491.954 |
| 2018-01-18 | 23399.411 |
| 2018-01-19 | 23397.843 |
| 2018-01-22 | 23532.395 |
| 2018-01-23 | 23527.637 |
| 2018-01-24 | 23440.409 |
| 2018-01-26 | 23418.125 |
| 2018-01-29 | 23540.695 |
| 2018-01-30 | 23431.33 |
| 2018-01-31 | 23383.735 |
| 2018-02-01 | 23376.993 |
| 2018-02-02 | 23383.666 |
| 2018-02-05 | 23444.507 |
| 2018-02-06 | 23601.69 |
| 2018-02-07 | 23669.328 |
| 2018-02-08 | 23680.302 |
| 2018-02-09 | 23534.982 |
| 2018-02-14 | 23567.304 |
| 2018-02-15 | 23460.306 |
| 2018-02-16 | 23406.329 |
| 2018-02-19 | 23462.467 |
| 2018-02-20 | 23642.597 |
| 2018-02-21 | 23654.81 |
| 2018-02-22 | 23718.913 |
| 2018-02-23 | 23869.879 |
| 2018-02-26 | 24152.768 |
| 2018-02-27 | 24218.469 |
| 2018-02-28 | 24155.786 |
| 2018-03-01 | 24179.312 |
| 2018-03-02 | 24192.992 |
| 2018-03-05 | 23948.464 |
| 2018-03-06 | 23870.126 |
| 2018-03-07 | 23809.61 |
| 2018-03-08 | 23952.136 |
| 2018-03-09 | 24038.047 |
| 2018-03-12 | 24162.24 |
| 2018-03-13 | 24523.592 |
| 2018-03-14 | 24363.977 |
| 2018-03-15 | 24008.304 |
| 2018-03-16 | 23845.63 |
| 2018-03-19 | 23706.509 |
| 2018-03-20 | 23828.067 |
| 2018-03-21 | 23685.785 |
| 2018-03-22 | 23571.722 |
| 2018-03-23 | 23430.014 |
| 2018-03-26 | 23567.66 |
| 2018-03-27 | 23612.881 |
| 2018-03-28 | 23525.005 |
| 2018-03-29 | 23501.342 |
| 2018-04-02 | 23552.884 |
| 2018-04-03 | 23665.965 |
| 2018-04-04 | 23776.851 |
| 2018-04-05 | 23911.541 |
| 2018-04-06 | 24030.974 |
| 2018-04-09 | 24060.523 |
| 2018-04-10 | 23908.145 |
| 2018-04-11 | 23701.07 |
| 2018-04-12 | 23737.92 |
| 2018-04-13 | 23731.996 |
| 2018-04-16 | 23641.608 |
| 2018-04-17 | 23637.313 |
| 2018-04-18 | 23539.447 |
| 2018-04-19 | 23489.778 |
| 2018-04-20 | 23532.11 |
| 2018-04-23 | 23723.041 |
| 2018-04-24 | 23798.469 |
| 2018-04-25 | 23784.154 |
| 2018-04-26 | 23780.839 |
| 2018-04-27 | 23798.453 |
| 2018-04-30 | 23910.287 |
| 2018-05-02 | 23965.209 |
| 2018-05-03 | 24056.891 |
| 2018-05-04 | 23918.453 |
| 2018-05-07 | 23939.402 |
| 2018-05-08 | 24064.407 |
| 2018-05-09 | 23920.272 |
| 2018-05-10 | 23799.651 |
| 2018-05-11 | 23824.506 |
| 2018-05-14 | 23987.168 |
| 2018-05-15 | 24017.024 |
| 2018-05-16 | 24133.63 |
| 2018-05-17 | 24272.683 |
| 2018-05-18 | 24589.269 |
| 2018-05-21 | 24689.357 |
| 2018-05-22 | 24628.686 |
| 2018-05-23 | 24505.318 |
| 2018-05-24 | 24582.012 |
| 2018-05-25 | 24593.512 |
| 2018-05-28 | 24549.47 |
| 2018-05-29 | 24535.191 |
| 2018-05-30 | 24537.352 |
| 2018-06-01 | 24709.391 |
| 2018-06-04 | 24567.388 |
| 2018-06-05 | 24429.8 |
| 2018-06-06 | 24415.279 |
| 2018-06-07 | 24336.602 |
| 2018-06-08 | 24066.705 |
| 2018-06-11 | 23914.116 |
| 2018-06-12 | 23701.309 |
| 2018-06-13 | 23463.128 |
| 2018-06-14 | 23500.627 |
| 2018-06-15 | 23585.876 |
| 2018-06-18 | 23653.453 |
| 2018-06-19 | 23619.223 |
| 2018-06-20 | 23556.243 |
| 2018-06-21 | 23434.414 |
| 2018-06-22 | 23446.355 |
| 2018-06-25 | 23404.853 |
| 2018-06-26 | 23410.988 |
| 2018-06-27 | 23468.682 |
| 2018-06-28 | 23448.863 |
| 2018-06-29 | 23419.728 |
| 2018-07-02 | 23321.575 |
| 2018-07-03 | 23349.661 |
| 2018-07-04 | 23358.474 |
| 2018-07-05 | 23322.862 |
| 2018-07-06 | 23551.561 |
| 2018-07-10 | 23376.429 |
| 2018-07-11 | 23421.643 |
| 2018-07-12 | 23444.041 |
| 2018-07-13 | 23344.093 |
| 2018-07-16 | 23506.446 |
| 2018-07-17 | 23524.531 |
| 2018-07-18 | 23602.218 |
| 2018-07-19 | 23772.417 |
| 2018-07-20 | 23746.517 |
| 2018-07-23 | 23872.151 |
| 2018-07-24 | 23886.82 |
| 2018-07-25 | 23892.013 |
| 2018-07-26 | 23955.792 |
| 2018-07-27 | 24074.248 |
| 2018-07-30 | 24160.95 |
| 2018-07-31 | 24051.201 |
| 2018-08-01 | 23949.037 |
| 2018-08-02 | 23854.003 |
| 2018-08-03 | 23899.358 |
| 2018-08-06 | 23973.425 |
| 2018-08-07 | 24172.79 |
| 2018-08-08 | 24119.948 |
| 2018-08-09 | 24161.043 |
| 2018-08-10 | 24131.977 |
| 2018-08-13 | 24076.633 |
| 2018-08-14 | 23974.42 |
| 2018-08-15 | 23969.447 |
| 2018-08-16 | 23971.899 |
| 2018-08-17 | 24102.587 |
| 2018-08-20 | 24085.54 |
| 2018-08-21 | 24263.147 |
| 2018-08-22 | 24379.044 |
| 2018-08-23 | 24430.977 |
| 2018-08-24 | 24603.014 |
| 2018-08-27 | 24656.505 |
| 2018-08-28 | 24515.846 |
| 2018-08-29 | 24398.368 |
| 2018-08-30 | 24541.817 |
| 2018-08-31 | 24656.227 |
| 2018-09-03 | 24615.741 |
| 2018-09-04 | 24752.975 |
| 2018-09-05 | 24767.51 |
| 2018-09-06 | 24616.761 |
| 2018-09-10 | 24437.656 |
| 2018-09-11 | 24421.017 |
| 2018-09-12 | 24365.507 |
| 2018-09-13 | 24480.221 |
| 2018-09-14 | 24505.913 |
| 2018-09-17 | 24403.799 |
| 2018-09-18 | 24249.028 |
| 2018-09-19 | 24066.192 |
| 2018-09-20 | 24121.114 |
| 2018-09-21 | 24233.389 |
| 2018-09-24 | 24212.735 |
| 2018-09-25 | 24118.965 |
| 2018-09-26 | 23930.959 |
| 2018-09-27 | 23944.68 |
| 2018-09-28 | 24184.699 |
| 2018-10-01 | 24156.917 |
| 2018-10-02 | 24140.873 |
| 2018-10-03 | 23992.096 |
| 2018-10-04 | 23933.988 |
| 2018-10-05 | 23931.029 |
| 2018-10-08 | 23843.078 |
| 2018-10-09 | 23672.877 |
| 2018-10-10 | 23522.349 |
| 2018-10-11 | 23575.933 |
| 2018-10-15 | 23642.826 |
| 2018-10-16 | 23545.183 |
| 2018-10-17 | 23527.871 |
| 2018-10-18 | 23405.153 |
| 2018-10-19 | 23447.319 |
| 2018-10-22 | 23149.009 |
| 2018-10-23 | 23298.431 |
| 2018-10-24 | 23364.451 |
| 2018-10-25 | 23361.706 |
| 2018-10-26 | 23235.471 |
| 2018-10-29 | 23098.493 |
| 2018-10-30 | 23196.579 |
| 2018-10-31 | 23288.574 |
| 2018-11-01 | 23428.279 |
| 2018-11-05 | 23456.55 |
| 2018-11-06 | 23470.461 |
| 2018-11-07 | 23416.308 |
| 2018-11-08 | 23659.095 |
| 2018-11-09 | 23657.15 |
| 2018-11-12 | 23591.718 |
| 2018-11-13 | 23623.74 |
| 2018-11-14 | 23590.188 |
| 2018-11-16 | 23575.161 |
| 2018-11-19 | 23653.895 |
| 2018-11-21 | 23765.535 |
| 2018-11-22 | 23873.381 |
| 2018-11-23 | 23608.193 |
| 2018-11-26 | 23649.872 |
| 2018-11-27 | 23794.026 |
| 2018-11-28 | 23645.137 |
| 2018-11-29 | 23482.993 |
| 2018-11-30 | 23286.85 |
| 2018-12-03 | 23414.234 |